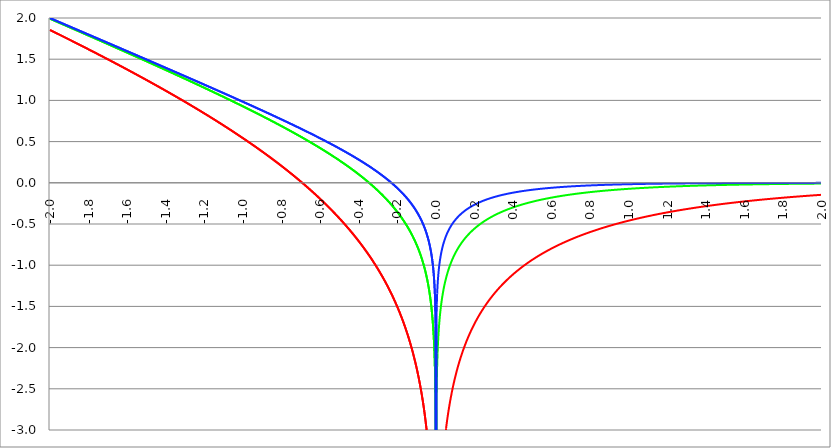
| Category | Series 1 | Series 0 | Series 2 |
|---|---|---|---|
| -2.0 | 1.855 | 1.991 | 1.999 |
| -1.998 | 1.852 | 1.989 | 1.997 |
| -1.996 | 1.85 | 1.987 | 1.995 |
| -1.994 | 1.848 | 1.985 | 1.993 |
| -1.992 | 1.845 | 1.983 | 1.991 |
| -1.99 | 1.843 | 1.981 | 1.989 |
| -1.988 | 1.841 | 1.979 | 1.987 |
| -1.986 | 1.838 | 1.976 | 1.985 |
| -1.984 | 1.836 | 1.974 | 1.983 |
| -1.982 | 1.834 | 1.972 | 1.981 |
| -1.98 | 1.831 | 1.97 | 1.979 |
| -1.978 | 1.829 | 1.968 | 1.977 |
| -1.976 | 1.827 | 1.966 | 1.975 |
| -1.974 | 1.824 | 1.964 | 1.973 |
| -1.972 | 1.822 | 1.962 | 1.971 |
| -1.97 | 1.82 | 1.96 | 1.969 |
| -1.968 | 1.817 | 1.958 | 1.967 |
| -1.966 | 1.815 | 1.956 | 1.965 |
| -1.964 | 1.813 | 1.954 | 1.963 |
| -1.962 | 1.811 | 1.952 | 1.961 |
| -1.96 | 1.808 | 1.95 | 1.959 |
| -1.958 | 1.806 | 1.948 | 1.957 |
| -1.956 | 1.804 | 1.946 | 1.955 |
| -1.954 | 1.801 | 1.944 | 1.953 |
| -1.952 | 1.799 | 1.942 | 1.951 |
| -1.95 | 1.797 | 1.94 | 1.949 |
| -1.948 | 1.794 | 1.938 | 1.947 |
| -1.946 | 1.792 | 1.936 | 1.945 |
| -1.944 | 1.79 | 1.934 | 1.943 |
| -1.942 | 1.787 | 1.932 | 1.941 |
| -1.94 | 1.785 | 1.93 | 1.939 |
| -1.938 | 1.783 | 1.928 | 1.937 |
| -1.936 | 1.78 | 1.925 | 1.935 |
| -1.934 | 1.778 | 1.923 | 1.933 |
| -1.932 | 1.776 | 1.921 | 1.931 |
| -1.93 | 1.773 | 1.919 | 1.929 |
| -1.928 | 1.771 | 1.917 | 1.927 |
| -1.926 | 1.768 | 1.915 | 1.925 |
| -1.924 | 1.766 | 1.913 | 1.923 |
| -1.922 | 1.764 | 1.911 | 1.921 |
| -1.92 | 1.761 | 1.909 | 1.919 |
| -1.918 | 1.759 | 1.907 | 1.917 |
| -1.916 | 1.757 | 1.905 | 1.915 |
| -1.914 | 1.754 | 1.903 | 1.913 |
| -1.912 | 1.752 | 1.901 | 1.911 |
| -1.91 | 1.75 | 1.899 | 1.909 |
| -1.908 | 1.747 | 1.897 | 1.907 |
| -1.906 | 1.745 | 1.895 | 1.905 |
| -1.904 | 1.743 | 1.893 | 1.903 |
| -1.902 | 1.74 | 1.891 | 1.901 |
| -1.9 | 1.738 | 1.889 | 1.899 |
| -1.898 | 1.736 | 1.887 | 1.897 |
| -1.896 | 1.733 | 1.885 | 1.895 |
| -1.894 | 1.731 | 1.883 | 1.893 |
| -1.892 | 1.729 | 1.881 | 1.891 |
| -1.89 | 1.726 | 1.878 | 1.889 |
| -1.888 | 1.724 | 1.876 | 1.887 |
| -1.886 | 1.722 | 1.874 | 1.885 |
| -1.884 | 1.719 | 1.872 | 1.883 |
| -1.882 | 1.717 | 1.87 | 1.881 |
| -1.88 | 1.714 | 1.868 | 1.879 |
| -1.878 | 1.712 | 1.866 | 1.877 |
| -1.876 | 1.71 | 1.864 | 1.875 |
| -1.874 | 1.707 | 1.862 | 1.873 |
| -1.872 | 1.705 | 1.86 | 1.871 |
| -1.87 | 1.703 | 1.858 | 1.869 |
| -1.868 | 1.7 | 1.856 | 1.867 |
| -1.866 | 1.698 | 1.854 | 1.865 |
| -1.864 | 1.696 | 1.852 | 1.863 |
| -1.862 | 1.693 | 1.85 | 1.861 |
| -1.86 | 1.691 | 1.848 | 1.859 |
| -1.858 | 1.688 | 1.846 | 1.857 |
| -1.856 | 1.686 | 1.844 | 1.855 |
| -1.854 | 1.684 | 1.842 | 1.853 |
| -1.852 | 1.681 | 1.84 | 1.851 |
| -1.85 | 1.679 | 1.837 | 1.849 |
| -1.848 | 1.677 | 1.835 | 1.847 |
| -1.846 | 1.674 | 1.833 | 1.845 |
| -1.844 | 1.672 | 1.831 | 1.843 |
| -1.842 | 1.669 | 1.829 | 1.841 |
| -1.84 | 1.667 | 1.827 | 1.839 |
| -1.838 | 1.665 | 1.825 | 1.837 |
| -1.836 | 1.662 | 1.823 | 1.835 |
| -1.834 | 1.66 | 1.821 | 1.833 |
| -1.832 | 1.658 | 1.819 | 1.831 |
| -1.83 | 1.655 | 1.817 | 1.829 |
| -1.828 | 1.653 | 1.815 | 1.827 |
| -1.826 | 1.65 | 1.813 | 1.825 |
| -1.824 | 1.648 | 1.811 | 1.823 |
| -1.822 | 1.646 | 1.809 | 1.821 |
| -1.82 | 1.643 | 1.807 | 1.819 |
| -1.818 | 1.641 | 1.805 | 1.817 |
| -1.816 | 1.638 | 1.803 | 1.815 |
| -1.814 | 1.636 | 1.801 | 1.813 |
| -1.812 | 1.634 | 1.798 | 1.811 |
| -1.81 | 1.631 | 1.796 | 1.809 |
| -1.808 | 1.629 | 1.794 | 1.807 |
| -1.806 | 1.627 | 1.792 | 1.805 |
| -1.804 | 1.624 | 1.79 | 1.803 |
| -1.802 | 1.622 | 1.788 | 1.801 |
| -1.8 | 1.619 | 1.786 | 1.798 |
| -1.798 | 1.617 | 1.784 | 1.796 |
| -1.796 | 1.615 | 1.782 | 1.794 |
| -1.794 | 1.612 | 1.78 | 1.792 |
| -1.792 | 1.61 | 1.778 | 1.79 |
| -1.79 | 1.607 | 1.776 | 1.788 |
| -1.788 | 1.605 | 1.774 | 1.786 |
| -1.786 | 1.603 | 1.772 | 1.784 |
| -1.784 | 1.6 | 1.77 | 1.782 |
| -1.782 | 1.598 | 1.768 | 1.78 |
| -1.78 | 1.595 | 1.766 | 1.778 |
| -1.778 | 1.593 | 1.764 | 1.776 |
| -1.776 | 1.59 | 1.761 | 1.774 |
| -1.774 | 1.588 | 1.759 | 1.772 |
| -1.772 | 1.586 | 1.757 | 1.77 |
| -1.77 | 1.583 | 1.755 | 1.768 |
| -1.768 | 1.581 | 1.753 | 1.766 |
| -1.766 | 1.578 | 1.751 | 1.764 |
| -1.764 | 1.576 | 1.749 | 1.762 |
| -1.762 | 1.574 | 1.747 | 1.76 |
| -1.76 | 1.571 | 1.745 | 1.758 |
| -1.758 | 1.569 | 1.743 | 1.756 |
| -1.756 | 1.566 | 1.741 | 1.754 |
| -1.754 | 1.564 | 1.739 | 1.752 |
| -1.752 | 1.562 | 1.737 | 1.75 |
| -1.75 | 1.559 | 1.735 | 1.748 |
| -1.748 | 1.557 | 1.733 | 1.746 |
| -1.746 | 1.554 | 1.731 | 1.744 |
| -1.744 | 1.552 | 1.728 | 1.742 |
| -1.742 | 1.549 | 1.726 | 1.74 |
| -1.74 | 1.547 | 1.724 | 1.738 |
| -1.738 | 1.545 | 1.722 | 1.736 |
| -1.736 | 1.542 | 1.72 | 1.734 |
| -1.734 | 1.54 | 1.718 | 1.732 |
| -1.732 | 1.537 | 1.716 | 1.73 |
| -1.73 | 1.535 | 1.714 | 1.728 |
| -1.728 | 1.532 | 1.712 | 1.726 |
| -1.726 | 1.53 | 1.71 | 1.724 |
| -1.724 | 1.528 | 1.708 | 1.722 |
| -1.722 | 1.525 | 1.706 | 1.72 |
| -1.72 | 1.523 | 1.704 | 1.718 |
| -1.718 | 1.52 | 1.702 | 1.716 |
| -1.716 | 1.518 | 1.7 | 1.714 |
| -1.714 | 1.515 | 1.698 | 1.712 |
| -1.712 | 1.513 | 1.695 | 1.71 |
| -1.71 | 1.51 | 1.693 | 1.708 |
| -1.708 | 1.508 | 1.691 | 1.706 |
| -1.706 | 1.506 | 1.689 | 1.704 |
| -1.704 | 1.503 | 1.687 | 1.702 |
| -1.702 | 1.501 | 1.685 | 1.7 |
| -1.7 | 1.498 | 1.683 | 1.698 |
| -1.698 | 1.496 | 1.681 | 1.696 |
| -1.696 | 1.493 | 1.679 | 1.694 |
| -1.694 | 1.491 | 1.677 | 1.692 |
| -1.692 | 1.488 | 1.675 | 1.69 |
| -1.69 | 1.486 | 1.673 | 1.688 |
| -1.688 | 1.484 | 1.671 | 1.686 |
| -1.686 | 1.481 | 1.669 | 1.684 |
| -1.684 | 1.479 | 1.666 | 1.682 |
| -1.682 | 1.476 | 1.664 | 1.68 |
| -1.68 | 1.474 | 1.662 | 1.678 |
| -1.678 | 1.471 | 1.66 | 1.676 |
| -1.676 | 1.469 | 1.658 | 1.674 |
| -1.674 | 1.466 | 1.656 | 1.672 |
| -1.672 | 1.464 | 1.654 | 1.67 |
| -1.67 | 1.461 | 1.652 | 1.668 |
| -1.668 | 1.459 | 1.65 | 1.666 |
| -1.666 | 1.457 | 1.648 | 1.664 |
| -1.664 | 1.454 | 1.646 | 1.662 |
| -1.662 | 1.452 | 1.644 | 1.66 |
| -1.66 | 1.449 | 1.642 | 1.658 |
| -1.658 | 1.447 | 1.64 | 1.656 |
| -1.656 | 1.444 | 1.637 | 1.654 |
| -1.654 | 1.442 | 1.635 | 1.652 |
| -1.652 | 1.439 | 1.633 | 1.65 |
| -1.65 | 1.437 | 1.631 | 1.648 |
| -1.648 | 1.434 | 1.629 | 1.646 |
| -1.646 | 1.432 | 1.627 | 1.644 |
| -1.644 | 1.429 | 1.625 | 1.642 |
| -1.642 | 1.427 | 1.623 | 1.64 |
| -1.64 | 1.424 | 1.621 | 1.638 |
| -1.638 | 1.422 | 1.619 | 1.636 |
| -1.636 | 1.419 | 1.617 | 1.634 |
| -1.634 | 1.417 | 1.615 | 1.632 |
| -1.632 | 1.414 | 1.613 | 1.629 |
| -1.63 | 1.412 | 1.61 | 1.627 |
| -1.628 | 1.409 | 1.608 | 1.625 |
| -1.626 | 1.407 | 1.606 | 1.623 |
| -1.624 | 1.404 | 1.604 | 1.621 |
| -1.622 | 1.402 | 1.602 | 1.619 |
| -1.62 | 1.399 | 1.6 | 1.617 |
| -1.618 | 1.397 | 1.598 | 1.615 |
| -1.616 | 1.394 | 1.596 | 1.613 |
| -1.614 | 1.392 | 1.594 | 1.611 |
| -1.612 | 1.389 | 1.592 | 1.609 |
| -1.61 | 1.387 | 1.59 | 1.607 |
| -1.608 | 1.384 | 1.588 | 1.605 |
| -1.606 | 1.382 | 1.585 | 1.603 |
| -1.604 | 1.379 | 1.583 | 1.601 |
| -1.602 | 1.377 | 1.581 | 1.599 |
| -1.6 | 1.374 | 1.579 | 1.597 |
| -1.598 | 1.372 | 1.577 | 1.595 |
| -1.596 | 1.369 | 1.575 | 1.593 |
| -1.594 | 1.367 | 1.573 | 1.591 |
| -1.592 | 1.364 | 1.571 | 1.589 |
| -1.59 | 1.362 | 1.569 | 1.587 |
| -1.588 | 1.359 | 1.567 | 1.585 |
| -1.586 | 1.357 | 1.565 | 1.583 |
| -1.584 | 1.354 | 1.563 | 1.581 |
| -1.582 | 1.352 | 1.56 | 1.579 |
| -1.58 | 1.349 | 1.558 | 1.577 |
| -1.578 | 1.347 | 1.556 | 1.575 |
| -1.576 | 1.344 | 1.554 | 1.573 |
| -1.574 | 1.342 | 1.552 | 1.571 |
| -1.572 | 1.339 | 1.55 | 1.569 |
| -1.57 | 1.337 | 1.548 | 1.567 |
| -1.568 | 1.334 | 1.546 | 1.565 |
| -1.566 | 1.332 | 1.544 | 1.563 |
| -1.564 | 1.329 | 1.542 | 1.561 |
| -1.562 | 1.327 | 1.54 | 1.559 |
| -1.56 | 1.324 | 1.537 | 1.557 |
| -1.558 | 1.322 | 1.535 | 1.555 |
| -1.556 | 1.319 | 1.533 | 1.553 |
| -1.554 | 1.317 | 1.531 | 1.551 |
| -1.552 | 1.314 | 1.529 | 1.549 |
| -1.55 | 1.311 | 1.527 | 1.547 |
| -1.548 | 1.309 | 1.525 | 1.545 |
| -1.546 | 1.306 | 1.523 | 1.543 |
| -1.544 | 1.304 | 1.521 | 1.541 |
| -1.542 | 1.301 | 1.519 | 1.539 |
| -1.54 | 1.299 | 1.516 | 1.537 |
| -1.538 | 1.296 | 1.514 | 1.535 |
| -1.536 | 1.294 | 1.512 | 1.533 |
| -1.534 | 1.291 | 1.51 | 1.531 |
| -1.532 | 1.289 | 1.508 | 1.529 |
| -1.53 | 1.286 | 1.506 | 1.527 |
| -1.528 | 1.283 | 1.504 | 1.525 |
| -1.526 | 1.281 | 1.502 | 1.523 |
| -1.524 | 1.278 | 1.5 | 1.521 |
| -1.522 | 1.276 | 1.498 | 1.519 |
| -1.52 | 1.273 | 1.495 | 1.516 |
| -1.518 | 1.271 | 1.493 | 1.514 |
| -1.516 | 1.268 | 1.491 | 1.512 |
| -1.514 | 1.266 | 1.489 | 1.51 |
| -1.512 | 1.263 | 1.487 | 1.508 |
| -1.51 | 1.26 | 1.485 | 1.506 |
| -1.508 | 1.258 | 1.483 | 1.504 |
| -1.506 | 1.255 | 1.481 | 1.502 |
| -1.504 | 1.253 | 1.479 | 1.5 |
| -1.502 | 1.25 | 1.477 | 1.498 |
| -1.5 | 1.248 | 1.474 | 1.496 |
| -1.498 | 1.245 | 1.472 | 1.494 |
| -1.496 | 1.242 | 1.47 | 1.492 |
| -1.494 | 1.24 | 1.468 | 1.49 |
| -1.492 | 1.237 | 1.466 | 1.488 |
| -1.49 | 1.235 | 1.464 | 1.486 |
| -1.488 | 1.232 | 1.462 | 1.484 |
| -1.486 | 1.229 | 1.46 | 1.482 |
| -1.484 | 1.227 | 1.458 | 1.48 |
| -1.482 | 1.224 | 1.456 | 1.478 |
| -1.48 | 1.222 | 1.453 | 1.476 |
| -1.478 | 1.219 | 1.451 | 1.474 |
| -1.476 | 1.217 | 1.449 | 1.472 |
| -1.474 | 1.214 | 1.447 | 1.47 |
| -1.472 | 1.211 | 1.445 | 1.468 |
| -1.469999999999999 | 1.209 | 1.443 | 1.466 |
| -1.467999999999999 | 1.206 | 1.441 | 1.464 |
| -1.465999999999999 | 1.204 | 1.439 | 1.462 |
| -1.463999999999999 | 1.201 | 1.437 | 1.46 |
| -1.461999999999999 | 1.198 | 1.434 | 1.458 |
| -1.459999999999999 | 1.196 | 1.432 | 1.456 |
| -1.457999999999999 | 1.193 | 1.43 | 1.454 |
| -1.455999999999999 | 1.191 | 1.428 | 1.452 |
| -1.453999999999999 | 1.188 | 1.426 | 1.45 |
| -1.451999999999999 | 1.185 | 1.424 | 1.448 |
| -1.449999999999999 | 1.183 | 1.422 | 1.446 |
| -1.447999999999999 | 1.18 | 1.42 | 1.444 |
| -1.445999999999999 | 1.177 | 1.417 | 1.442 |
| -1.443999999999999 | 1.175 | 1.415 | 1.44 |
| -1.441999999999999 | 1.172 | 1.413 | 1.438 |
| -1.439999999999999 | 1.17 | 1.411 | 1.436 |
| -1.437999999999999 | 1.167 | 1.409 | 1.434 |
| -1.435999999999999 | 1.164 | 1.407 | 1.431 |
| -1.433999999999999 | 1.162 | 1.405 | 1.429 |
| -1.431999999999999 | 1.159 | 1.403 | 1.427 |
| -1.429999999999999 | 1.156 | 1.401 | 1.425 |
| -1.427999999999999 | 1.154 | 1.398 | 1.423 |
| -1.425999999999999 | 1.151 | 1.396 | 1.421 |
| -1.423999999999999 | 1.149 | 1.394 | 1.419 |
| -1.421999999999999 | 1.146 | 1.392 | 1.417 |
| -1.419999999999999 | 1.143 | 1.39 | 1.415 |
| -1.417999999999999 | 1.141 | 1.388 | 1.413 |
| -1.415999999999999 | 1.138 | 1.386 | 1.411 |
| -1.413999999999999 | 1.135 | 1.384 | 1.409 |
| -1.411999999999999 | 1.133 | 1.381 | 1.407 |
| -1.409999999999999 | 1.13 | 1.379 | 1.405 |
| -1.407999999999999 | 1.127 | 1.377 | 1.403 |
| -1.405999999999999 | 1.125 | 1.375 | 1.401 |
| -1.403999999999999 | 1.122 | 1.373 | 1.399 |
| -1.401999999999999 | 1.119 | 1.371 | 1.397 |
| -1.399999999999999 | 1.117 | 1.369 | 1.395 |
| -1.397999999999999 | 1.114 | 1.367 | 1.393 |
| -1.395999999999999 | 1.112 | 1.364 | 1.391 |
| -1.393999999999999 | 1.109 | 1.362 | 1.389 |
| -1.391999999999999 | 1.106 | 1.36 | 1.387 |
| -1.389999999999999 | 1.104 | 1.358 | 1.385 |
| -1.387999999999999 | 1.101 | 1.356 | 1.383 |
| -1.385999999999999 | 1.098 | 1.354 | 1.381 |
| -1.383999999999999 | 1.096 | 1.352 | 1.379 |
| -1.381999999999999 | 1.093 | 1.349 | 1.377 |
| -1.379999999999999 | 1.09 | 1.347 | 1.375 |
| -1.377999999999999 | 1.088 | 1.345 | 1.373 |
| -1.375999999999999 | 1.085 | 1.343 | 1.371 |
| -1.373999999999999 | 1.082 | 1.341 | 1.369 |
| -1.371999999999999 | 1.08 | 1.339 | 1.367 |
| -1.369999999999999 | 1.077 | 1.337 | 1.364 |
| -1.367999999999999 | 1.074 | 1.334 | 1.362 |
| -1.365999999999999 | 1.071 | 1.332 | 1.36 |
| -1.363999999999999 | 1.069 | 1.33 | 1.358 |
| -1.361999999999999 | 1.066 | 1.328 | 1.356 |
| -1.359999999999999 | 1.063 | 1.326 | 1.354 |
| -1.357999999999999 | 1.061 | 1.324 | 1.352 |
| -1.355999999999999 | 1.058 | 1.322 | 1.35 |
| -1.353999999999999 | 1.055 | 1.32 | 1.348 |
| -1.351999999999999 | 1.053 | 1.317 | 1.346 |
| -1.349999999999999 | 1.05 | 1.315 | 1.344 |
| -1.347999999999999 | 1.047 | 1.313 | 1.342 |
| -1.345999999999999 | 1.045 | 1.311 | 1.34 |
| -1.343999999999999 | 1.042 | 1.309 | 1.338 |
| -1.341999999999999 | 1.039 | 1.307 | 1.336 |
| -1.339999999999999 | 1.036 | 1.304 | 1.334 |
| -1.337999999999999 | 1.034 | 1.302 | 1.332 |
| -1.335999999999999 | 1.031 | 1.3 | 1.33 |
| -1.333999999999999 | 1.028 | 1.298 | 1.328 |
| -1.331999999999999 | 1.026 | 1.296 | 1.326 |
| -1.329999999999999 | 1.023 | 1.294 | 1.324 |
| -1.327999999999999 | 1.02 | 1.292 | 1.322 |
| -1.325999999999999 | 1.017 | 1.289 | 1.32 |
| -1.323999999999999 | 1.015 | 1.287 | 1.318 |
| -1.321999999999999 | 1.012 | 1.285 | 1.316 |
| -1.319999999999999 | 1.009 | 1.283 | 1.314 |
| -1.317999999999999 | 1.006 | 1.281 | 1.312 |
| -1.315999999999999 | 1.004 | 1.279 | 1.31 |
| -1.313999999999999 | 1.001 | 1.277 | 1.307 |
| -1.311999999999999 | 0.998 | 1.274 | 1.305 |
| -1.309999999999999 | 0.996 | 1.272 | 1.303 |
| -1.307999999999999 | 0.993 | 1.27 | 1.301 |
| -1.305999999999999 | 0.99 | 1.268 | 1.299 |
| -1.303999999999999 | 0.987 | 1.266 | 1.297 |
| -1.301999999999999 | 0.985 | 1.264 | 1.295 |
| -1.299999999999999 | 0.982 | 1.261 | 1.293 |
| -1.297999999999999 | 0.979 | 1.259 | 1.291 |
| -1.295999999999999 | 0.976 | 1.257 | 1.289 |
| -1.293999999999999 | 0.974 | 1.255 | 1.287 |
| -1.291999999999999 | 0.971 | 1.253 | 1.285 |
| -1.289999999999999 | 0.968 | 1.251 | 1.283 |
| -1.287999999999999 | 0.965 | 1.248 | 1.281 |
| -1.285999999999999 | 0.963 | 1.246 | 1.279 |
| -1.283999999999999 | 0.96 | 1.244 | 1.277 |
| -1.281999999999999 | 0.957 | 1.242 | 1.275 |
| -1.279999999999999 | 0.954 | 1.24 | 1.273 |
| -1.277999999999999 | 0.951 | 1.238 | 1.271 |
| -1.275999999999999 | 0.949 | 1.235 | 1.269 |
| -1.273999999999999 | 0.946 | 1.233 | 1.267 |
| -1.271999999999999 | 0.943 | 1.231 | 1.265 |
| -1.269999999999999 | 0.94 | 1.229 | 1.263 |
| -1.267999999999999 | 0.938 | 1.227 | 1.26 |
| -1.265999999999999 | 0.935 | 1.225 | 1.258 |
| -1.263999999999999 | 0.932 | 1.222 | 1.256 |
| -1.261999999999999 | 0.929 | 1.22 | 1.254 |
| -1.259999999999999 | 0.926 | 1.218 | 1.252 |
| -1.257999999999999 | 0.924 | 1.216 | 1.25 |
| -1.255999999999999 | 0.921 | 1.214 | 1.248 |
| -1.253999999999999 | 0.918 | 1.212 | 1.246 |
| -1.251999999999999 | 0.915 | 1.209 | 1.244 |
| -1.249999999999999 | 0.912 | 1.207 | 1.242 |
| -1.247999999999999 | 0.91 | 1.205 | 1.24 |
| -1.245999999999999 | 0.907 | 1.203 | 1.238 |
| -1.243999999999999 | 0.904 | 1.201 | 1.236 |
| -1.241999999999999 | 0.901 | 1.198 | 1.234 |
| -1.239999999999999 | 0.898 | 1.196 | 1.232 |
| -1.237999999999999 | 0.896 | 1.194 | 1.23 |
| -1.235999999999999 | 0.893 | 1.192 | 1.228 |
| -1.233999999999999 | 0.89 | 1.19 | 1.226 |
| -1.231999999999999 | 0.887 | 1.188 | 1.224 |
| -1.229999999999999 | 0.884 | 1.185 | 1.222 |
| -1.227999999999999 | 0.881 | 1.183 | 1.22 |
| -1.225999999999999 | 0.879 | 1.181 | 1.217 |
| -1.223999999999999 | 0.876 | 1.179 | 1.215 |
| -1.221999999999999 | 0.873 | 1.177 | 1.213 |
| -1.219999999999999 | 0.87 | 1.174 | 1.211 |
| -1.217999999999999 | 0.867 | 1.172 | 1.209 |
| -1.215999999999999 | 0.864 | 1.17 | 1.207 |
| -1.213999999999999 | 0.862 | 1.168 | 1.205 |
| -1.211999999999999 | 0.859 | 1.166 | 1.203 |
| -1.209999999999999 | 0.856 | 1.163 | 1.201 |
| -1.207999999999999 | 0.853 | 1.161 | 1.199 |
| -1.205999999999999 | 0.85 | 1.159 | 1.197 |
| -1.203999999999999 | 0.847 | 1.157 | 1.195 |
| -1.201999999999999 | 0.844 | 1.155 | 1.193 |
| -1.199999999999999 | 0.842 | 1.152 | 1.191 |
| -1.197999999999999 | 0.839 | 1.15 | 1.189 |
| -1.195999999999999 | 0.836 | 1.148 | 1.187 |
| -1.193999999999999 | 0.833 | 1.146 | 1.185 |
| -1.191999999999999 | 0.83 | 1.144 | 1.183 |
| -1.189999999999999 | 0.827 | 1.141 | 1.18 |
| -1.187999999999999 | 0.824 | 1.139 | 1.178 |
| -1.185999999999999 | 0.822 | 1.137 | 1.176 |
| -1.183999999999999 | 0.819 | 1.135 | 1.174 |
| -1.181999999999999 | 0.816 | 1.133 | 1.172 |
| -1.179999999999999 | 0.813 | 1.13 | 1.17 |
| -1.177999999999999 | 0.81 | 1.128 | 1.168 |
| -1.175999999999999 | 0.807 | 1.126 | 1.166 |
| -1.173999999999999 | 0.804 | 1.124 | 1.164 |
| -1.171999999999999 | 0.801 | 1.122 | 1.162 |
| -1.169999999999999 | 0.798 | 1.119 | 1.16 |
| -1.167999999999999 | 0.796 | 1.117 | 1.158 |
| -1.165999999999999 | 0.793 | 1.115 | 1.156 |
| -1.163999999999999 | 0.79 | 1.113 | 1.154 |
| -1.161999999999999 | 0.787 | 1.11 | 1.152 |
| -1.159999999999999 | 0.784 | 1.108 | 1.15 |
| -1.157999999999999 | 0.781 | 1.106 | 1.148 |
| -1.155999999999999 | 0.778 | 1.104 | 1.145 |
| -1.153999999999999 | 0.775 | 1.102 | 1.143 |
| -1.151999999999999 | 0.772 | 1.099 | 1.141 |
| -1.149999999999999 | 0.769 | 1.097 | 1.139 |
| -1.147999999999999 | 0.766 | 1.095 | 1.137 |
| -1.145999999999999 | 0.763 | 1.093 | 1.135 |
| -1.143999999999999 | 0.76 | 1.091 | 1.133 |
| -1.141999999999999 | 0.758 | 1.088 | 1.131 |
| -1.139999999999999 | 0.755 | 1.086 | 1.129 |
| -1.137999999999999 | 0.752 | 1.084 | 1.127 |
| -1.135999999999999 | 0.749 | 1.082 | 1.125 |
| -1.133999999999999 | 0.746 | 1.079 | 1.123 |
| -1.131999999999999 | 0.743 | 1.077 | 1.121 |
| -1.129999999999999 | 0.74 | 1.075 | 1.119 |
| -1.127999999999999 | 0.737 | 1.073 | 1.117 |
| -1.125999999999999 | 0.734 | 1.07 | 1.114 |
| -1.123999999999999 | 0.731 | 1.068 | 1.112 |
| -1.121999999999999 | 0.728 | 1.066 | 1.11 |
| -1.119999999999999 | 0.725 | 1.064 | 1.108 |
| -1.117999999999999 | 0.722 | 1.061 | 1.106 |
| -1.115999999999999 | 0.719 | 1.059 | 1.104 |
| -1.113999999999999 | 0.716 | 1.057 | 1.102 |
| -1.111999999999999 | 0.713 | 1.055 | 1.1 |
| -1.109999999999999 | 0.71 | 1.053 | 1.098 |
| -1.107999999999999 | 0.707 | 1.05 | 1.096 |
| -1.105999999999999 | 0.704 | 1.048 | 1.094 |
| -1.103999999999999 | 0.701 | 1.046 | 1.092 |
| -1.101999999999999 | 0.698 | 1.044 | 1.09 |
| -1.099999999999999 | 0.695 | 1.041 | 1.087 |
| -1.097999999999999 | 0.692 | 1.039 | 1.085 |
| -1.095999999999999 | 0.689 | 1.037 | 1.083 |
| -1.093999999999999 | 0.686 | 1.035 | 1.081 |
| -1.091999999999999 | 0.683 | 1.032 | 1.079 |
| -1.089999999999999 | 0.68 | 1.03 | 1.077 |
| -1.087999999999999 | 0.677 | 1.028 | 1.075 |
| -1.085999999999999 | 0.674 | 1.026 | 1.073 |
| -1.083999999999999 | 0.671 | 1.023 | 1.071 |
| -1.081999999999999 | 0.668 | 1.021 | 1.069 |
| -1.079999999999999 | 0.665 | 1.019 | 1.067 |
| -1.077999999999999 | 0.662 | 1.016 | 1.065 |
| -1.075999999999999 | 0.659 | 1.014 | 1.063 |
| -1.073999999999999 | 0.656 | 1.012 | 1.06 |
| -1.071999999999999 | 0.653 | 1.01 | 1.058 |
| -1.069999999999999 | 0.65 | 1.007 | 1.056 |
| -1.067999999999999 | 0.647 | 1.005 | 1.054 |
| -1.065999999999999 | 0.644 | 1.003 | 1.052 |
| -1.063999999999999 | 0.641 | 1.001 | 1.05 |
| -1.061999999999999 | 0.638 | 0.998 | 1.048 |
| -1.059999999999999 | 0.635 | 0.996 | 1.046 |
| -1.057999999999999 | 0.632 | 0.994 | 1.044 |
| -1.055999999999999 | 0.629 | 0.992 | 1.042 |
| -1.053999999999999 | 0.625 | 0.989 | 1.04 |
| -1.051999999999999 | 0.622 | 0.987 | 1.037 |
| -1.049999999999999 | 0.619 | 0.985 | 1.035 |
| -1.047999999999999 | 0.616 | 0.982 | 1.033 |
| -1.045999999999999 | 0.613 | 0.98 | 1.031 |
| -1.043999999999999 | 0.61 | 0.978 | 1.029 |
| -1.041999999999999 | 0.607 | 0.976 | 1.027 |
| -1.039999999999999 | 0.604 | 0.973 | 1.025 |
| -1.037999999999999 | 0.601 | 0.971 | 1.023 |
| -1.035999999999999 | 0.598 | 0.969 | 1.021 |
| -1.033999999999999 | 0.595 | 0.966 | 1.019 |
| -1.031999999999999 | 0.591 | 0.964 | 1.017 |
| -1.029999999999999 | 0.588 | 0.962 | 1.014 |
| -1.027999999999999 | 0.585 | 0.96 | 1.012 |
| -1.025999999999999 | 0.582 | 0.957 | 1.01 |
| -1.023999999999999 | 0.579 | 0.955 | 1.008 |
| -1.021999999999999 | 0.576 | 0.953 | 1.006 |
| -1.019999999999999 | 0.573 | 0.95 | 1.004 |
| -1.017999999999999 | 0.57 | 0.948 | 1.002 |
| -1.015999999999999 | 0.567 | 0.946 | 1 |
| -1.013999999999999 | 0.563 | 0.943 | 0.998 |
| -1.011999999999999 | 0.56 | 0.941 | 0.996 |
| -1.009999999999999 | 0.557 | 0.939 | 0.993 |
| -1.007999999999999 | 0.554 | 0.937 | 0.991 |
| -1.005999999999999 | 0.551 | 0.934 | 0.989 |
| -1.003999999999999 | 0.548 | 0.932 | 0.987 |
| -1.001999999999999 | 0.544 | 0.93 | 0.985 |
| -0.999999999999999 | 0.541 | 0.927 | 0.983 |
| -0.997999999999999 | 0.538 | 0.925 | 0.981 |
| -0.995999999999999 | 0.535 | 0.923 | 0.979 |
| -0.993999999999999 | 0.532 | 0.92 | 0.977 |
| -0.991999999999999 | 0.529 | 0.918 | 0.975 |
| -0.989999999999999 | 0.525 | 0.916 | 0.972 |
| -0.987999999999999 | 0.522 | 0.913 | 0.97 |
| -0.985999999999999 | 0.519 | 0.911 | 0.968 |
| -0.983999999999999 | 0.516 | 0.909 | 0.966 |
| -0.981999999999999 | 0.513 | 0.906 | 0.964 |
| -0.979999999999999 | 0.509 | 0.904 | 0.962 |
| -0.977999999999999 | 0.506 | 0.902 | 0.96 |
| -0.975999999999999 | 0.503 | 0.899 | 0.958 |
| -0.973999999999999 | 0.5 | 0.897 | 0.956 |
| -0.971999999999999 | 0.497 | 0.895 | 0.953 |
| -0.969999999999999 | 0.493 | 0.892 | 0.951 |
| -0.967999999999999 | 0.49 | 0.89 | 0.949 |
| -0.965999999999999 | 0.487 | 0.888 | 0.947 |
| -0.963999999999999 | 0.484 | 0.885 | 0.945 |
| -0.961999999999999 | 0.481 | 0.883 | 0.943 |
| -0.959999999999999 | 0.477 | 0.881 | 0.941 |
| -0.957999999999999 | 0.474 | 0.878 | 0.939 |
| -0.955999999999999 | 0.471 | 0.876 | 0.937 |
| -0.953999999999999 | 0.468 | 0.874 | 0.934 |
| -0.951999999999999 | 0.464 | 0.871 | 0.932 |
| -0.949999999999999 | 0.461 | 0.869 | 0.93 |
| -0.947999999999999 | 0.458 | 0.867 | 0.928 |
| -0.945999999999999 | 0.455 | 0.864 | 0.926 |
| -0.943999999999999 | 0.451 | 0.862 | 0.924 |
| -0.941999999999999 | 0.448 | 0.86 | 0.922 |
| -0.939999999999999 | 0.445 | 0.857 | 0.92 |
| -0.937999999999999 | 0.441 | 0.855 | 0.917 |
| -0.935999999999999 | 0.438 | 0.852 | 0.915 |
| -0.933999999999999 | 0.435 | 0.85 | 0.913 |
| -0.931999999999999 | 0.432 | 0.848 | 0.911 |
| -0.929999999999999 | 0.428 | 0.845 | 0.909 |
| -0.927999999999999 | 0.425 | 0.843 | 0.907 |
| -0.925999999999999 | 0.422 | 0.841 | 0.905 |
| -0.923999999999999 | 0.418 | 0.838 | 0.902 |
| -0.921999999999999 | 0.415 | 0.836 | 0.9 |
| -0.919999999999999 | 0.412 | 0.834 | 0.898 |
| -0.917999999999999 | 0.408 | 0.831 | 0.896 |
| -0.915999999999999 | 0.405 | 0.829 | 0.894 |
| -0.913999999999999 | 0.402 | 0.826 | 0.892 |
| -0.911999999999999 | 0.398 | 0.824 | 0.89 |
| -0.909999999999999 | 0.395 | 0.822 | 0.888 |
| -0.907999999999999 | 0.392 | 0.819 | 0.885 |
| -0.905999999999999 | 0.388 | 0.817 | 0.883 |
| -0.903999999999999 | 0.385 | 0.814 | 0.881 |
| -0.901999999999999 | 0.382 | 0.812 | 0.879 |
| -0.899999999999999 | 0.378 | 0.81 | 0.877 |
| -0.897999999999999 | 0.375 | 0.807 | 0.875 |
| -0.895999999999999 | 0.371 | 0.805 | 0.873 |
| -0.893999999999999 | 0.368 | 0.802 | 0.87 |
| -0.891999999999999 | 0.365 | 0.8 | 0.868 |
| -0.889999999999999 | 0.361 | 0.798 | 0.866 |
| -0.887999999999999 | 0.358 | 0.795 | 0.864 |
| -0.885999999999999 | 0.354 | 0.793 | 0.862 |
| -0.883999999999999 | 0.351 | 0.79 | 0.86 |
| -0.881999999999999 | 0.348 | 0.788 | 0.857 |
| -0.879999999999999 | 0.344 | 0.786 | 0.855 |
| -0.877999999999999 | 0.341 | 0.783 | 0.853 |
| -0.875999999999999 | 0.337 | 0.781 | 0.851 |
| -0.873999999999999 | 0.334 | 0.778 | 0.849 |
| -0.871999999999999 | 0.331 | 0.776 | 0.847 |
| -0.869999999999999 | 0.327 | 0.773 | 0.845 |
| -0.867999999999999 | 0.324 | 0.771 | 0.842 |
| -0.865999999999999 | 0.32 | 0.769 | 0.84 |
| -0.863999999999999 | 0.317 | 0.766 | 0.838 |
| -0.861999999999999 | 0.313 | 0.764 | 0.836 |
| -0.859999999999999 | 0.31 | 0.761 | 0.834 |
| -0.857999999999999 | 0.306 | 0.759 | 0.832 |
| -0.855999999999999 | 0.303 | 0.756 | 0.829 |
| -0.853999999999999 | 0.299 | 0.754 | 0.827 |
| -0.851999999999999 | 0.296 | 0.752 | 0.825 |
| -0.849999999999999 | 0.292 | 0.749 | 0.823 |
| -0.847999999999999 | 0.289 | 0.747 | 0.821 |
| -0.845999999999999 | 0.285 | 0.744 | 0.819 |
| -0.843999999999999 | 0.282 | 0.742 | 0.816 |
| -0.841999999999999 | 0.278 | 0.739 | 0.814 |
| -0.839999999999999 | 0.275 | 0.737 | 0.812 |
| -0.837999999999999 | 0.271 | 0.734 | 0.81 |
| -0.835999999999999 | 0.268 | 0.732 | 0.808 |
| -0.833999999999999 | 0.264 | 0.729 | 0.806 |
| -0.831999999999999 | 0.261 | 0.727 | 0.803 |
| -0.829999999999999 | 0.257 | 0.725 | 0.801 |
| -0.827999999999999 | 0.254 | 0.722 | 0.799 |
| -0.825999999999999 | 0.25 | 0.72 | 0.797 |
| -0.823999999999999 | 0.247 | 0.717 | 0.795 |
| -0.821999999999999 | 0.243 | 0.715 | 0.792 |
| -0.819999999999999 | 0.239 | 0.712 | 0.79 |
| -0.817999999999999 | 0.236 | 0.71 | 0.788 |
| -0.815999999999999 | 0.232 | 0.707 | 0.786 |
| -0.813999999999999 | 0.229 | 0.705 | 0.784 |
| -0.811999999999999 | 0.225 | 0.702 | 0.781 |
| -0.809999999999999 | 0.221 | 0.7 | 0.779 |
| -0.807999999999999 | 0.218 | 0.697 | 0.777 |
| -0.805999999999999 | 0.214 | 0.695 | 0.775 |
| -0.803999999999999 | 0.211 | 0.692 | 0.773 |
| -0.801999999999999 | 0.207 | 0.69 | 0.77 |
| -0.799999999999999 | 0.203 | 0.687 | 0.768 |
| -0.797999999999999 | 0.2 | 0.685 | 0.766 |
| -0.795999999999999 | 0.196 | 0.682 | 0.764 |
| -0.793999999999999 | 0.192 | 0.68 | 0.762 |
| -0.791999999999999 | 0.189 | 0.677 | 0.759 |
| -0.789999999999999 | 0.185 | 0.675 | 0.757 |
| -0.787999999999999 | 0.181 | 0.672 | 0.755 |
| -0.785999999999999 | 0.178 | 0.67 | 0.753 |
| -0.783999999999999 | 0.174 | 0.667 | 0.751 |
| -0.781999999999999 | 0.17 | 0.665 | 0.748 |
| -0.779999999999999 | 0.167 | 0.662 | 0.746 |
| -0.777999999999999 | 0.163 | 0.66 | 0.744 |
| -0.775999999999999 | 0.159 | 0.657 | 0.742 |
| -0.773999999999999 | 0.156 | 0.654 | 0.74 |
| -0.771999999999999 | 0.152 | 0.652 | 0.737 |
| -0.769999999999999 | 0.148 | 0.649 | 0.735 |
| -0.767999999999999 | 0.144 | 0.647 | 0.733 |
| -0.765999999999999 | 0.141 | 0.644 | 0.731 |
| -0.763999999999999 | 0.137 | 0.642 | 0.728 |
| -0.761999999999999 | 0.133 | 0.639 | 0.726 |
| -0.759999999999999 | 0.13 | 0.637 | 0.724 |
| -0.757999999999999 | 0.126 | 0.634 | 0.722 |
| -0.755999999999999 | 0.122 | 0.631 | 0.72 |
| -0.753999999999999 | 0.118 | 0.629 | 0.717 |
| -0.751999999999999 | 0.114 | 0.626 | 0.715 |
| -0.749999999999999 | 0.111 | 0.624 | 0.713 |
| -0.747999999999999 | 0.107 | 0.621 | 0.711 |
| -0.745999999999999 | 0.103 | 0.619 | 0.708 |
| -0.743999999999999 | 0.099 | 0.616 | 0.706 |
| -0.741999999999999 | 0.095 | 0.613 | 0.704 |
| -0.739999999999999 | 0.092 | 0.611 | 0.702 |
| -0.737999999999999 | 0.088 | 0.608 | 0.699 |
| -0.735999999999999 | 0.084 | 0.606 | 0.697 |
| -0.733999999999999 | 0.08 | 0.603 | 0.695 |
| -0.731999999999999 | 0.076 | 0.6 | 0.693 |
| -0.729999999999999 | 0.072 | 0.598 | 0.69 |
| -0.727999999999999 | 0.069 | 0.595 | 0.688 |
| -0.725999999999999 | 0.065 | 0.593 | 0.686 |
| -0.723999999999999 | 0.061 | 0.59 | 0.684 |
| -0.721999999999999 | 0.057 | 0.587 | 0.681 |
| -0.719999999999999 | 0.053 | 0.585 | 0.679 |
| -0.717999999999999 | 0.049 | 0.582 | 0.677 |
| -0.715999999999999 | 0.045 | 0.58 | 0.675 |
| -0.713999999999999 | 0.041 | 0.577 | 0.672 |
| -0.711999999999999 | 0.037 | 0.574 | 0.67 |
| -0.709999999999999 | 0.033 | 0.572 | 0.668 |
| -0.707999999999999 | 0.029 | 0.569 | 0.666 |
| -0.705999999999999 | 0.026 | 0.566 | 0.663 |
| -0.703999999999999 | 0.022 | 0.564 | 0.661 |
| -0.701999999999999 | 0.018 | 0.561 | 0.659 |
| -0.699999999999999 | 0.014 | 0.558 | 0.656 |
| -0.697999999999999 | 0.01 | 0.556 | 0.654 |
| -0.695999999999999 | 0.006 | 0.553 | 0.652 |
| -0.693999999999999 | 0.002 | 0.55 | 0.65 |
| -0.691999999999999 | -0.002 | 0.548 | 0.647 |
| -0.689999999999999 | -0.006 | 0.545 | 0.645 |
| -0.687999999999999 | -0.01 | 0.542 | 0.643 |
| -0.685999999999999 | -0.014 | 0.54 | 0.64 |
| -0.683999999999999 | -0.018 | 0.537 | 0.638 |
| -0.681999999999999 | -0.022 | 0.534 | 0.636 |
| -0.679999999999999 | -0.026 | 0.532 | 0.634 |
| -0.677999999999999 | -0.031 | 0.529 | 0.631 |
| -0.675999999999999 | -0.035 | 0.526 | 0.629 |
| -0.673999999999999 | -0.039 | 0.524 | 0.627 |
| -0.671999999999999 | -0.043 | 0.521 | 0.624 |
| -0.669999999999999 | -0.047 | 0.518 | 0.622 |
| -0.667999999999999 | -0.051 | 0.515 | 0.62 |
| -0.665999999999999 | -0.055 | 0.513 | 0.617 |
| -0.663999999999999 | -0.059 | 0.51 | 0.615 |
| -0.661999999999999 | -0.063 | 0.507 | 0.613 |
| -0.659999999999999 | -0.067 | 0.505 | 0.61 |
| -0.657999999999999 | -0.072 | 0.502 | 0.608 |
| -0.655999999999999 | -0.076 | 0.499 | 0.606 |
| -0.653999999999999 | -0.08 | 0.496 | 0.604 |
| -0.651999999999999 | -0.084 | 0.494 | 0.601 |
| -0.649999999999999 | -0.088 | 0.491 | 0.599 |
| -0.647999999999999 | -0.092 | 0.488 | 0.597 |
| -0.645999999999999 | -0.097 | 0.485 | 0.594 |
| -0.643999999999999 | -0.101 | 0.483 | 0.592 |
| -0.641999999999999 | -0.105 | 0.48 | 0.589 |
| -0.639999999999999 | -0.109 | 0.477 | 0.587 |
| -0.637999999999999 | -0.114 | 0.474 | 0.585 |
| -0.635999999999999 | -0.118 | 0.472 | 0.582 |
| -0.633999999999999 | -0.122 | 0.469 | 0.58 |
| -0.631999999999999 | -0.126 | 0.466 | 0.578 |
| -0.629999999999999 | -0.131 | 0.463 | 0.575 |
| -0.627999999999999 | -0.135 | 0.46 | 0.573 |
| -0.625999999999999 | -0.139 | 0.458 | 0.571 |
| -0.623999999999999 | -0.143 | 0.455 | 0.568 |
| -0.621999999999999 | -0.148 | 0.452 | 0.566 |
| -0.619999999999999 | -0.152 | 0.449 | 0.564 |
| -0.617999999999999 | -0.156 | 0.446 | 0.561 |
| -0.615999999999999 | -0.161 | 0.444 | 0.559 |
| -0.613999999999999 | -0.165 | 0.441 | 0.556 |
| -0.611999999999999 | -0.169 | 0.438 | 0.554 |
| -0.609999999999999 | -0.174 | 0.435 | 0.552 |
| -0.607999999999999 | -0.178 | 0.432 | 0.549 |
| -0.605999999999999 | -0.183 | 0.429 | 0.547 |
| -0.603999999999999 | -0.187 | 0.427 | 0.545 |
| -0.601999999999999 | -0.191 | 0.424 | 0.542 |
| -0.599999999999999 | -0.196 | 0.421 | 0.54 |
| -0.597999999999999 | -0.2 | 0.418 | 0.537 |
| -0.595999999999999 | -0.205 | 0.415 | 0.535 |
| -0.593999999999999 | -0.209 | 0.412 | 0.533 |
| -0.591999999999999 | -0.214 | 0.409 | 0.53 |
| -0.589999999999999 | -0.218 | 0.406 | 0.528 |
| -0.587999999999999 | -0.223 | 0.404 | 0.525 |
| -0.585999999999999 | -0.227 | 0.401 | 0.523 |
| -0.583999999999999 | -0.232 | 0.398 | 0.521 |
| -0.581999999999999 | -0.236 | 0.395 | 0.518 |
| -0.579999999999999 | -0.241 | 0.392 | 0.516 |
| -0.577999999999999 | -0.245 | 0.389 | 0.513 |
| -0.575999999999999 | -0.25 | 0.386 | 0.511 |
| -0.573999999999999 | -0.254 | 0.383 | 0.508 |
| -0.571999999999999 | -0.259 | 0.38 | 0.506 |
| -0.569999999999999 | -0.264 | 0.377 | 0.503 |
| -0.567999999999999 | -0.268 | 0.374 | 0.501 |
| -0.565999999999999 | -0.273 | 0.371 | 0.499 |
| -0.563999999999999 | -0.277 | 0.368 | 0.496 |
| -0.561999999999999 | -0.282 | 0.365 | 0.494 |
| -0.559999999999999 | -0.287 | 0.363 | 0.491 |
| -0.557999999999999 | -0.291 | 0.36 | 0.489 |
| -0.555999999999999 | -0.296 | 0.357 | 0.486 |
| -0.553999999999999 | -0.301 | 0.354 | 0.484 |
| -0.551999999999999 | -0.306 | 0.351 | 0.481 |
| -0.549999999999999 | -0.31 | 0.348 | 0.479 |
| -0.547999999999999 | -0.315 | 0.345 | 0.476 |
| -0.545999999999999 | -0.32 | 0.342 | 0.474 |
| -0.543999999999999 | -0.325 | 0.339 | 0.471 |
| -0.541999999999999 | -0.329 | 0.336 | 0.469 |
| -0.539999999999999 | -0.334 | 0.333 | 0.466 |
| -0.537999999999999 | -0.339 | 0.33 | 0.464 |
| -0.535999999999999 | -0.344 | 0.326 | 0.461 |
| -0.533999999999999 | -0.349 | 0.323 | 0.459 |
| -0.531999999999999 | -0.353 | 0.32 | 0.456 |
| -0.529999999999999 | -0.358 | 0.317 | 0.454 |
| -0.527999999999999 | -0.363 | 0.314 | 0.451 |
| -0.525999999999999 | -0.368 | 0.311 | 0.449 |
| -0.523999999999999 | -0.373 | 0.308 | 0.446 |
| -0.521999999999999 | -0.378 | 0.305 | 0.444 |
| -0.519999999999999 | -0.383 | 0.302 | 0.441 |
| -0.517999999999999 | -0.388 | 0.299 | 0.439 |
| -0.515999999999999 | -0.393 | 0.296 | 0.436 |
| -0.513999999999999 | -0.398 | 0.293 | 0.434 |
| -0.511999999999999 | -0.403 | 0.29 | 0.431 |
| -0.509999999999999 | -0.408 | 0.286 | 0.429 |
| -0.507999999999999 | -0.413 | 0.283 | 0.426 |
| -0.505999999999999 | -0.418 | 0.28 | 0.424 |
| -0.503999999999999 | -0.423 | 0.277 | 0.421 |
| -0.501999999999999 | -0.428 | 0.274 | 0.418 |
| -0.499999999999999 | -0.433 | 0.271 | 0.416 |
| -0.497999999999999 | -0.438 | 0.267 | 0.413 |
| -0.495999999999999 | -0.443 | 0.264 | 0.411 |
| -0.493999999999999 | -0.448 | 0.261 | 0.408 |
| -0.491999999999999 | -0.453 | 0.258 | 0.406 |
| -0.489999999999999 | -0.458 | 0.255 | 0.403 |
| -0.487999999999999 | -0.464 | 0.252 | 0.4 |
| -0.485999999999999 | -0.469 | 0.248 | 0.398 |
| -0.483999999999999 | -0.474 | 0.245 | 0.395 |
| -0.481999999999999 | -0.479 | 0.242 | 0.392 |
| -0.479999999999999 | -0.484 | 0.239 | 0.39 |
| -0.477999999999999 | -0.49 | 0.235 | 0.387 |
| -0.475999999999999 | -0.495 | 0.232 | 0.385 |
| -0.473999999999999 | -0.5 | 0.229 | 0.382 |
| -0.471999999999999 | -0.506 | 0.226 | 0.379 |
| -0.469999999999999 | -0.511 | 0.222 | 0.377 |
| -0.467999999999999 | -0.516 | 0.219 | 0.374 |
| -0.465999999999999 | -0.522 | 0.216 | 0.371 |
| -0.463999999999999 | -0.527 | 0.212 | 0.369 |
| -0.461999999999999 | -0.532 | 0.209 | 0.366 |
| -0.459999999999999 | -0.538 | 0.206 | 0.363 |
| -0.457999999999999 | -0.543 | 0.202 | 0.361 |
| -0.455999999999999 | -0.549 | 0.199 | 0.358 |
| -0.453999999999999 | -0.554 | 0.196 | 0.355 |
| -0.451999999999999 | -0.56 | 0.192 | 0.353 |
| -0.449999999999999 | -0.565 | 0.189 | 0.35 |
| -0.447999999999999 | -0.571 | 0.186 | 0.347 |
| -0.445999999999999 | -0.576 | 0.182 | 0.345 |
| -0.443999999999999 | -0.582 | 0.179 | 0.342 |
| -0.441999999999999 | -0.587 | 0.176 | 0.339 |
| -0.439999999999999 | -0.593 | 0.172 | 0.336 |
| -0.437999999999999 | -0.599 | 0.169 | 0.334 |
| -0.435999999999999 | -0.604 | 0.165 | 0.331 |
| -0.433999999999999 | -0.61 | 0.162 | 0.328 |
| -0.431999999999999 | -0.616 | 0.158 | 0.325 |
| -0.429999999999999 | -0.621 | 0.155 | 0.323 |
| -0.427999999999999 | -0.627 | 0.151 | 0.32 |
| -0.425999999999999 | -0.633 | 0.148 | 0.317 |
| -0.423999999999999 | -0.639 | 0.144 | 0.314 |
| -0.421999999999999 | -0.644 | 0.141 | 0.312 |
| -0.419999999999999 | -0.65 | 0.137 | 0.309 |
| -0.417999999999999 | -0.656 | 0.134 | 0.306 |
| -0.415999999999999 | -0.662 | 0.13 | 0.303 |
| -0.413999999999999 | -0.668 | 0.127 | 0.3 |
| -0.411999999999999 | -0.674 | 0.123 | 0.298 |
| -0.409999999999999 | -0.68 | 0.12 | 0.295 |
| -0.407999999999999 | -0.686 | 0.116 | 0.292 |
| -0.405999999999999 | -0.692 | 0.113 | 0.289 |
| -0.403999999999999 | -0.698 | 0.109 | 0.286 |
| -0.401999999999999 | -0.704 | 0.105 | 0.283 |
| -0.399999999999999 | -0.71 | 0.102 | 0.281 |
| -0.397999999999999 | -0.716 | 0.098 | 0.278 |
| -0.395999999999999 | -0.722 | 0.094 | 0.275 |
| -0.393999999999999 | -0.728 | 0.091 | 0.272 |
| -0.391999999999999 | -0.734 | 0.087 | 0.269 |
| -0.389999999999999 | -0.74 | 0.083 | 0.266 |
| -0.387999999999999 | -0.746 | 0.08 | 0.263 |
| -0.385999999999999 | -0.753 | 0.076 | 0.26 |
| -0.383999999999999 | -0.759 | 0.072 | 0.257 |
| -0.381999999999999 | -0.765 | 0.069 | 0.254 |
| -0.379999999999999 | -0.772 | 0.065 | 0.252 |
| -0.377999999999999 | -0.778 | 0.061 | 0.249 |
| -0.375999999999999 | -0.784 | 0.057 | 0.246 |
| -0.373999999999999 | -0.791 | 0.053 | 0.243 |
| -0.371999999999999 | -0.797 | 0.05 | 0.24 |
| -0.369999999999998 | -0.804 | 0.046 | 0.237 |
| -0.367999999999998 | -0.81 | 0.042 | 0.234 |
| -0.365999999999998 | -0.817 | 0.038 | 0.231 |
| -0.363999999999998 | -0.823 | 0.034 | 0.228 |
| -0.361999999999998 | -0.83 | 0.03 | 0.225 |
| -0.359999999999998 | -0.836 | 0.027 | 0.222 |
| -0.357999999999998 | -0.843 | 0.023 | 0.219 |
| -0.355999999999998 | -0.85 | 0.019 | 0.216 |
| -0.353999999999998 | -0.856 | 0.015 | 0.213 |
| -0.351999999999998 | -0.863 | 0.011 | 0.21 |
| -0.349999999999998 | -0.87 | 0.007 | 0.206 |
| -0.347999999999998 | -0.877 | 0.003 | 0.203 |
| -0.345999999999998 | -0.883 | -0.001 | 0.2 |
| -0.343999999999998 | -0.89 | -0.005 | 0.197 |
| -0.341999999999998 | -0.897 | -0.009 | 0.194 |
| -0.339999999999998 | -0.904 | -0.013 | 0.191 |
| -0.337999999999998 | -0.911 | -0.017 | 0.188 |
| -0.335999999999998 | -0.918 | -0.021 | 0.185 |
| -0.333999999999998 | -0.925 | -0.025 | 0.181 |
| -0.331999999999998 | -0.932 | -0.03 | 0.178 |
| -0.329999999999998 | -0.939 | -0.034 | 0.175 |
| -0.327999999999998 | -0.946 | -0.038 | 0.172 |
| -0.325999999999998 | -0.953 | -0.042 | 0.169 |
| -0.323999999999998 | -0.961 | -0.046 | 0.166 |
| -0.321999999999998 | -0.968 | -0.05 | 0.162 |
| -0.319999999999998 | -0.975 | -0.055 | 0.159 |
| -0.317999999999998 | -0.982 | -0.059 | 0.156 |
| -0.315999999999998 | -0.99 | -0.063 | 0.153 |
| -0.313999999999998 | -0.997 | -0.067 | 0.149 |
| -0.311999999999998 | -1.005 | -0.072 | 0.146 |
| -0.309999999999998 | -1.012 | -0.076 | 0.143 |
| -0.307999999999998 | -1.02 | -0.08 | 0.139 |
| -0.305999999999998 | -1.027 | -0.085 | 0.136 |
| -0.303999999999998 | -1.035 | -0.089 | 0.133 |
| -0.301999999999998 | -1.043 | -0.094 | 0.129 |
| -0.299999999999998 | -1.05 | -0.098 | 0.126 |
| -0.297999999999998 | -1.058 | -0.102 | 0.123 |
| -0.295999999999998 | -1.066 | -0.107 | 0.119 |
| -0.293999999999998 | -1.074 | -0.111 | 0.116 |
| -0.291999999999998 | -1.081 | -0.116 | 0.112 |
| -0.289999999999998 | -1.089 | -0.12 | 0.109 |
| -0.287999999999998 | -1.097 | -0.125 | 0.106 |
| -0.285999999999998 | -1.105 | -0.13 | 0.102 |
| -0.283999999999998 | -1.113 | -0.134 | 0.099 |
| -0.281999999999998 | -1.122 | -0.139 | 0.095 |
| -0.279999999999998 | -1.13 | -0.143 | 0.092 |
| -0.277999999999998 | -1.138 | -0.148 | 0.088 |
| -0.275999999999998 | -1.146 | -0.153 | 0.085 |
| -0.273999999999998 | -1.155 | -0.157 | 0.081 |
| -0.271999999999998 | -1.163 | -0.162 | 0.077 |
| -0.269999999999998 | -1.171 | -0.167 | 0.074 |
| -0.267999999999998 | -1.18 | -0.172 | 0.07 |
| -0.265999999999998 | -1.188 | -0.177 | 0.067 |
| -0.263999999999998 | -1.197 | -0.182 | 0.063 |
| -0.261999999999998 | -1.206 | -0.186 | 0.059 |
| -0.259999999999998 | -1.214 | -0.191 | 0.056 |
| -0.257999999999998 | -1.223 | -0.196 | 0.052 |
| -0.255999999999998 | -1.232 | -0.201 | 0.048 |
| -0.253999999999998 | -1.241 | -0.206 | 0.044 |
| -0.251999999999998 | -1.25 | -0.211 | 0.041 |
| -0.249999999999998 | -1.259 | -0.216 | 0.037 |
| -0.247999999999998 | -1.268 | -0.221 | 0.033 |
| -0.245999999999998 | -1.277 | -0.227 | 0.029 |
| -0.243999999999998 | -1.286 | -0.232 | 0.025 |
| -0.241999999999998 | -1.295 | -0.237 | 0.022 |
| -0.239999999999998 | -1.305 | -0.242 | 0.018 |
| -0.237999999999998 | -1.314 | -0.247 | 0.014 |
| -0.235999999999998 | -1.324 | -0.253 | 0.01 |
| -0.233999999999998 | -1.333 | -0.258 | 0.006 |
| -0.231999999999998 | -1.343 | -0.263 | 0.002 |
| -0.229999999999998 | -1.352 | -0.269 | -0.002 |
| -0.227999999999998 | -1.362 | -0.274 | -0.006 |
| -0.225999999999998 | -1.372 | -0.28 | -0.01 |
| -0.223999999999998 | -1.382 | -0.285 | -0.014 |
| -0.221999999999998 | -1.392 | -0.291 | -0.018 |
| -0.219999999999998 | -1.402 | -0.296 | -0.022 |
| -0.217999999999998 | -1.412 | -0.302 | -0.027 |
| -0.215999999999998 | -1.423 | -0.308 | -0.031 |
| -0.213999999999998 | -1.433 | -0.314 | -0.035 |
| -0.211999999999998 | -1.443 | -0.319 | -0.039 |
| -0.209999999999998 | -1.454 | -0.325 | -0.044 |
| -0.207999999999998 | -1.464 | -0.331 | -0.048 |
| -0.205999999999998 | -1.475 | -0.337 | -0.052 |
| -0.203999999999998 | -1.486 | -0.343 | -0.056 |
| -0.201999999999998 | -1.497 | -0.349 | -0.061 |
| -0.199999999999998 | -1.508 | -0.355 | -0.065 |
| -0.197999999999998 | -1.519 | -0.361 | -0.07 |
| -0.195999999999998 | -1.53 | -0.367 | -0.074 |
| -0.193999999999998 | -1.541 | -0.373 | -0.079 |
| -0.191999999999998 | -1.553 | -0.379 | -0.083 |
| -0.189999999999998 | -1.564 | -0.386 | -0.088 |
| -0.187999999999998 | -1.576 | -0.392 | -0.092 |
| -0.185999999999998 | -1.588 | -0.399 | -0.097 |
| -0.183999999999998 | -1.599 | -0.405 | -0.102 |
| -0.181999999999998 | -1.611 | -0.412 | -0.107 |
| -0.179999999999998 | -1.623 | -0.418 | -0.111 |
| -0.177999999999998 | -1.636 | -0.425 | -0.116 |
| -0.175999999999998 | -1.648 | -0.431 | -0.121 |
| -0.173999999999998 | -1.66 | -0.438 | -0.126 |
| -0.171999999999998 | -1.673 | -0.445 | -0.131 |
| -0.169999999999998 | -1.686 | -0.452 | -0.136 |
| -0.167999999999998 | -1.699 | -0.459 | -0.141 |
| -0.165999999999998 | -1.712 | -0.466 | -0.146 |
| -0.163999999999998 | -1.725 | -0.473 | -0.151 |
| -0.161999999999998 | -1.738 | -0.48 | -0.156 |
| -0.159999999999998 | -1.752 | -0.488 | -0.161 |
| -0.157999999999998 | -1.765 | -0.495 | -0.167 |
| -0.155999999999998 | -1.779 | -0.502 | -0.172 |
| -0.153999999999998 | -1.793 | -0.51 | -0.177 |
| -0.151999999999998 | -1.807 | -0.517 | -0.183 |
| -0.149999999999998 | -1.821 | -0.525 | -0.188 |
| -0.147999999999998 | -1.836 | -0.533 | -0.194 |
| -0.145999999999998 | -1.85 | -0.541 | -0.2 |
| -0.143999999999998 | -1.865 | -0.549 | -0.205 |
| -0.141999999999998 | -1.88 | -0.557 | -0.211 |
| -0.139999999999998 | -1.895 | -0.565 | -0.217 |
| -0.137999999999998 | -1.911 | -0.573 | -0.223 |
| -0.135999999999998 | -1.926 | -0.581 | -0.229 |
| -0.133999999999998 | -1.942 | -0.59 | -0.235 |
| -0.131999999999998 | -1.958 | -0.598 | -0.241 |
| -0.129999999999998 | -1.975 | -0.607 | -0.247 |
| -0.127999999999998 | -1.991 | -0.616 | -0.253 |
| -0.125999999999998 | -2.008 | -0.625 | -0.259 |
| -0.123999999999998 | -2.025 | -0.634 | -0.266 |
| -0.121999999999998 | -2.042 | -0.643 | -0.272 |
| -0.119999999999998 | -2.06 | -0.652 | -0.279 |
| -0.117999999999998 | -2.077 | -0.662 | -0.285 |
| -0.115999999999998 | -2.096 | -0.671 | -0.292 |
| -0.113999999999998 | -2.114 | -0.681 | -0.299 |
| -0.111999999999998 | -2.133 | -0.691 | -0.306 |
| -0.109999999999998 | -2.152 | -0.701 | -0.313 |
| -0.107999999999998 | -2.171 | -0.711 | -0.32 |
| -0.105999999999998 | -2.191 | -0.722 | -0.327 |
| -0.103999999999998 | -2.211 | -0.732 | -0.335 |
| -0.101999999999998 | -2.231 | -0.743 | -0.342 |
| -0.0999999999999983 | -2.252 | -0.754 | -0.35 |
| -0.0979999999999983 | -2.273 | -0.765 | -0.358 |
| -0.0959999999999983 | -2.295 | -0.776 | -0.366 |
| -0.0939999999999983 | -2.317 | -0.788 | -0.374 |
| -0.0919999999999983 | -2.34 | -0.8 | -0.382 |
| -0.0899999999999983 | -2.363 | -0.812 | -0.39 |
| -0.0879999999999983 | -2.386 | -0.824 | -0.399 |
| -0.0859999999999983 | -2.41 | -0.837 | -0.408 |
| -0.0839999999999983 | -2.435 | -0.849 | -0.417 |
| -0.0819999999999983 | -2.46 | -0.862 | -0.426 |
| -0.0799999999999983 | -2.485 | -0.876 | -0.435 |
| -0.0779999999999983 | -2.512 | -0.889 | -0.444 |
| -0.0759999999999983 | -2.539 | -0.903 | -0.454 |
| -0.0739999999999983 | -2.566 | -0.918 | -0.464 |
| -0.0719999999999983 | -2.595 | -0.933 | -0.474 |
| -0.0699999999999983 | -2.624 | -0.948 | -0.485 |
| -0.0679999999999983 | -2.654 | -0.963 | -0.495 |
| -0.0659999999999983 | -2.685 | -0.979 | -0.506 |
| -0.0639999999999983 | -2.717 | -0.996 | -0.518 |
| -0.0619999999999983 | -2.749 | -1.012 | -0.529 |
| -0.0599999999999983 | -2.783 | -1.03 | -0.541 |
| -0.0579999999999983 | -2.818 | -1.048 | -0.553 |
| -0.0559999999999983 | -2.854 | -1.066 | -0.566 |
| -0.0539999999999983 | -2.892 | -1.086 | -0.579 |
| -0.0519999999999983 | -2.93 | -1.105 | -0.593 |
| -0.0499999999999983 | -2.971 | -1.126 | -0.607 |
| -0.0479999999999983 | -3.012 | -1.148 | -0.622 |
| -0.0459999999999983 | -3.056 | -1.17 | -0.637 |
| -0.0439999999999983 | -3.101 | -1.193 | -0.653 |
| -0.0419999999999983 | -3.149 | -1.217 | -0.669 |
| -0.0399999999999983 | -3.199 | -1.243 | -0.687 |
| -0.0379999999999982 | -3.251 | -1.269 | -0.705 |
| -0.0359999999999982 | -3.306 | -1.297 | -0.724 |
| -0.0339999999999982 | -3.364 | -1.327 | -0.744 |
| -0.0319999999999982 | -3.426 | -1.358 | -0.765 |
| -0.0299999999999982 | -3.492 | -1.392 | -0.788 |
| -0.0279999999999982 | -3.562 | -1.427 | -0.812 |
| -0.0259999999999982 | -3.637 | -1.465 | -0.837 |
| -0.0239999999999982 | -3.718 | -1.506 | -0.865 |
| -0.0219999999999982 | -3.806 | -1.551 | -0.895 |
| -0.0199999999999982 | -3.902 | -1.599 | -0.928 |
| -0.0179999999999982 | -4.008 | -1.653 | -0.964 |
| -0.0159999999999982 | -4.127 | -1.713 | -1.004 |
| -0.0139999999999982 | -4.262 | -1.781 | -1.05 |
| -0.0119999999999982 | -4.417 | -1.859 | -1.102 |
| -0.00999999999999823 | -4.6 | -1.951 | -1.164 |
| -0.00799999999999824 | -4.824 | -2.064 | -1.239 |
| -0.00599999999999824 | -5.113 | -2.208 | -1.336 |
| -0.00399999999999824 | -5.519 | -2.412 | -1.472 |
| -0.00199999999999824 | -6.214 | -2.76 | -1.704 |
| 1.76247905159244e-15 | -33.964 | -16.636 | -10.955 |
| 0.00200000000000176 | -6.216 | -2.762 | -1.706 |
| 0.00400000000000176 | -5.523 | -2.416 | -1.476 |
| 0.00600000000000176 | -5.119 | -2.214 | -1.342 |
| 0.00800000000000176 | -4.832 | -2.072 | -1.247 |
| 0.0100000000000018 | -4.61 | -1.961 | -1.174 |
| 0.0120000000000018 | -4.429 | -1.871 | -1.114 |
| 0.0140000000000018 | -4.276 | -1.795 | -1.064 |
| 0.0160000000000018 | -4.143 | -1.729 | -1.02 |
| 0.0180000000000018 | -4.026 | -1.671 | -0.982 |
| 0.0200000000000018 | -3.922 | -1.619 | -0.948 |
| 0.0220000000000018 | -3.828 | -1.573 | -0.917 |
| 0.0240000000000018 | -3.742 | -1.53 | -0.889 |
| 0.0260000000000018 | -3.663 | -1.491 | -0.863 |
| 0.0280000000000018 | -3.59 | -1.455 | -0.84 |
| 0.0300000000000018 | -3.522 | -1.422 | -0.818 |
| 0.0320000000000018 | -3.458 | -1.39 | -0.797 |
| 0.0340000000000018 | -3.398 | -1.361 | -0.778 |
| 0.0360000000000018 | -3.342 | -1.333 | -0.76 |
| 0.0380000000000018 | -3.289 | -1.307 | -0.743 |
| 0.0400000000000018 | -3.239 | -1.283 | -0.727 |
| 0.0420000000000018 | -3.191 | -1.259 | -0.711 |
| 0.0440000000000018 | -3.145 | -1.237 | -0.697 |
| 0.0460000000000018 | -3.102 | -1.216 | -0.683 |
| 0.0480000000000018 | -3.06 | -1.196 | -0.67 |
| 0.0500000000000018 | -3.021 | -1.176 | -0.657 |
| 0.0520000000000018 | -2.982 | -1.157 | -0.645 |
| 0.0540000000000018 | -2.946 | -1.14 | -0.633 |
| 0.0560000000000018 | -2.91 | -1.122 | -0.622 |
| 0.0580000000000018 | -2.876 | -1.106 | -0.611 |
| 0.0600000000000018 | -2.843 | -1.09 | -0.601 |
| 0.0620000000000018 | -2.811 | -1.074 | -0.591 |
| 0.0640000000000018 | -2.781 | -1.06 | -0.582 |
| 0.0660000000000018 | -2.751 | -1.045 | -0.572 |
| 0.0680000000000018 | -2.722 | -1.031 | -0.563 |
| 0.0700000000000018 | -2.694 | -1.018 | -0.555 |
| 0.0720000000000018 | -2.667 | -1.005 | -0.546 |
| 0.0740000000000018 | -2.64 | -0.992 | -0.538 |
| 0.0760000000000018 | -2.615 | -0.979 | -0.53 |
| 0.0780000000000018 | -2.59 | -0.967 | -0.522 |
| 0.0800000000000018 | -2.565 | -0.956 | -0.515 |
| 0.0820000000000018 | -2.542 | -0.944 | -0.508 |
| 0.0840000000000018 | -2.519 | -0.933 | -0.501 |
| 0.0860000000000018 | -2.496 | -0.923 | -0.494 |
| 0.0880000000000018 | -2.474 | -0.912 | -0.487 |
| 0.0900000000000018 | -2.453 | -0.902 | -0.48 |
| 0.0920000000000018 | -2.432 | -0.892 | -0.474 |
| 0.0940000000000018 | -2.411 | -0.882 | -0.468 |
| 0.0960000000000018 | -2.391 | -0.872 | -0.462 |
| 0.0980000000000018 | -2.371 | -0.863 | -0.456 |
| 0.100000000000002 | -2.352 | -0.854 | -0.45 |
| 0.102000000000002 | -2.333 | -0.845 | -0.444 |
| 0.104000000000002 | -2.315 | -0.836 | -0.439 |
| 0.106000000000002 | -2.297 | -0.828 | -0.433 |
| 0.108000000000002 | -2.279 | -0.819 | -0.428 |
| 0.110000000000002 | -2.262 | -0.811 | -0.423 |
| 0.112000000000002 | -2.245 | -0.803 | -0.418 |
| 0.114000000000002 | -2.228 | -0.795 | -0.413 |
| 0.116000000000002 | -2.212 | -0.787 | -0.408 |
| 0.118000000000002 | -2.195 | -0.78 | -0.403 |
| 0.120000000000002 | -2.18 | -0.772 | -0.399 |
| 0.122000000000002 | -2.164 | -0.765 | -0.394 |
| 0.124000000000002 | -2.149 | -0.758 | -0.39 |
| 0.126000000000002 | -2.134 | -0.751 | -0.385 |
| 0.128000000000002 | -2.119 | -0.744 | -0.381 |
| 0.130000000000002 | -2.105 | -0.737 | -0.377 |
| 0.132000000000002 | -2.09 | -0.73 | -0.373 |
| 0.134000000000002 | -2.076 | -0.724 | -0.369 |
| 0.136000000000002 | -2.062 | -0.717 | -0.365 |
| 0.138000000000002 | -2.049 | -0.711 | -0.361 |
| 0.140000000000002 | -2.035 | -0.705 | -0.357 |
| 0.142000000000002 | -2.022 | -0.699 | -0.353 |
| 0.144000000000002 | -2.009 | -0.693 | -0.349 |
| 0.146000000000002 | -1.996 | -0.687 | -0.346 |
| 0.148000000000002 | -1.984 | -0.681 | -0.342 |
| 0.150000000000002 | -1.971 | -0.675 | -0.338 |
| 0.152000000000002 | -1.959 | -0.669 | -0.335 |
| 0.154000000000002 | -1.947 | -0.664 | -0.331 |
| 0.156000000000002 | -1.935 | -0.658 | -0.328 |
| 0.158000000000002 | -1.923 | -0.653 | -0.325 |
| 0.160000000000002 | -1.912 | -0.648 | -0.321 |
| 0.162000000000002 | -1.9 | -0.642 | -0.318 |
| 0.164000000000002 | -1.889 | -0.637 | -0.315 |
| 0.166000000000002 | -1.878 | -0.632 | -0.312 |
| 0.168000000000002 | -1.867 | -0.627 | -0.309 |
| 0.170000000000002 | -1.856 | -0.622 | -0.306 |
| 0.172000000000002 | -1.845 | -0.617 | -0.303 |
| 0.174000000000002 | -1.834 | -0.612 | -0.3 |
| 0.176000000000002 | -1.824 | -0.607 | -0.297 |
| 0.178000000000002 | -1.814 | -0.603 | -0.294 |
| 0.180000000000002 | -1.803 | -0.598 | -0.291 |
| 0.182000000000002 | -1.793 | -0.594 | -0.289 |
| 0.184000000000002 | -1.783 | -0.589 | -0.286 |
| 0.186000000000002 | -1.774 | -0.585 | -0.283 |
| 0.188000000000002 | -1.764 | -0.58 | -0.28 |
| 0.190000000000002 | -1.754 | -0.576 | -0.278 |
| 0.192000000000002 | -1.745 | -0.571 | -0.275 |
| 0.194000000000002 | -1.735 | -0.567 | -0.273 |
| 0.196000000000002 | -1.726 | -0.563 | -0.27 |
| 0.198000000000002 | -1.717 | -0.559 | -0.268 |
| 0.200000000000002 | -1.708 | -0.555 | -0.265 |
| 0.202000000000002 | -1.699 | -0.551 | -0.263 |
| 0.204000000000002 | -1.69 | -0.547 | -0.26 |
| 0.206000000000002 | -1.681 | -0.543 | -0.258 |
| 0.208000000000002 | -1.672 | -0.539 | -0.256 |
| 0.210000000000002 | -1.664 | -0.535 | -0.254 |
| 0.212000000000002 | -1.655 | -0.531 | -0.251 |
| 0.214000000000002 | -1.647 | -0.528 | -0.249 |
| 0.216000000000002 | -1.639 | -0.524 | -0.247 |
| 0.218000000000002 | -1.63 | -0.52 | -0.245 |
| 0.220000000000002 | -1.622 | -0.516 | -0.242 |
| 0.222000000000002 | -1.614 | -0.513 | -0.24 |
| 0.224000000000002 | -1.606 | -0.509 | -0.238 |
| 0.226000000000002 | -1.598 | -0.506 | -0.236 |
| 0.228000000000002 | -1.59 | -0.502 | -0.234 |
| 0.230000000000002 | -1.582 | -0.499 | -0.232 |
| 0.232000000000002 | -1.575 | -0.495 | -0.23 |
| 0.234000000000002 | -1.567 | -0.492 | -0.228 |
| 0.236000000000002 | -1.56 | -0.489 | -0.226 |
| 0.238000000000002 | -1.552 | -0.485 | -0.224 |
| 0.240000000000002 | -1.545 | -0.482 | -0.222 |
| 0.242000000000002 | -1.537 | -0.479 | -0.22 |
| 0.244000000000002 | -1.53 | -0.476 | -0.219 |
| 0.246000000000002 | -1.523 | -0.473 | -0.217 |
| 0.248000000000002 | -1.516 | -0.469 | -0.215 |
| 0.250000000000002 | -1.509 | -0.466 | -0.213 |
| 0.252000000000002 | -1.502 | -0.463 | -0.211 |
| 0.254000000000002 | -1.495 | -0.46 | -0.21 |
| 0.256000000000002 | -1.488 | -0.457 | -0.208 |
| 0.258000000000002 | -1.481 | -0.454 | -0.206 |
| 0.260000000000002 | -1.474 | -0.451 | -0.204 |
| 0.262000000000002 | -1.468 | -0.448 | -0.203 |
| 0.264000000000002 | -1.461 | -0.446 | -0.201 |
| 0.266000000000002 | -1.454 | -0.443 | -0.199 |
| 0.268000000000002 | -1.448 | -0.44 | -0.198 |
| 0.270000000000002 | -1.441 | -0.437 | -0.196 |
| 0.272000000000002 | -1.435 | -0.434 | -0.195 |
| 0.274000000000002 | -1.429 | -0.431 | -0.193 |
| 0.276000000000002 | -1.422 | -0.429 | -0.191 |
| 0.278000000000002 | -1.416 | -0.426 | -0.19 |
| 0.280000000000002 | -1.41 | -0.423 | -0.188 |
| 0.282000000000002 | -1.404 | -0.421 | -0.187 |
| 0.284000000000002 | -1.397 | -0.418 | -0.185 |
| 0.286000000000002 | -1.391 | -0.416 | -0.184 |
| 0.288000000000002 | -1.385 | -0.413 | -0.182 |
| 0.290000000000002 | -1.379 | -0.41 | -0.181 |
| 0.292000000000002 | -1.373 | -0.408 | -0.18 |
| 0.294000000000002 | -1.368 | -0.405 | -0.178 |
| 0.296000000000002 | -1.362 | -0.403 | -0.177 |
| 0.298000000000002 | -1.356 | -0.4 | -0.175 |
| 0.300000000000002 | -1.35 | -0.398 | -0.174 |
| 0.302000000000002 | -1.345 | -0.396 | -0.173 |
| 0.304000000000002 | -1.339 | -0.393 | -0.171 |
| 0.306000000000002 | -1.333 | -0.391 | -0.17 |
| 0.308000000000002 | -1.328 | -0.388 | -0.169 |
| 0.310000000000002 | -1.322 | -0.386 | -0.167 |
| 0.312000000000002 | -1.317 | -0.384 | -0.166 |
| 0.314000000000002 | -1.311 | -0.381 | -0.165 |
| 0.316000000000002 | -1.306 | -0.379 | -0.163 |
| 0.318000000000002 | -1.3 | -0.377 | -0.162 |
| 0.320000000000002 | -1.295 | -0.375 | -0.161 |
| 0.322000000000002 | -1.29 | -0.372 | -0.16 |
| 0.324000000000002 | -1.285 | -0.37 | -0.158 |
| 0.326000000000002 | -1.279 | -0.368 | -0.157 |
| 0.328000000000002 | -1.274 | -0.366 | -0.156 |
| 0.330000000000002 | -1.269 | -0.364 | -0.155 |
| 0.332000000000002 | -1.264 | -0.362 | -0.154 |
| 0.334000000000002 | -1.259 | -0.359 | -0.153 |
| 0.336000000000002 | -1.254 | -0.357 | -0.151 |
| 0.338000000000002 | -1.249 | -0.355 | -0.15 |
| 0.340000000000002 | -1.244 | -0.353 | -0.149 |
| 0.342000000000002 | -1.239 | -0.351 | -0.148 |
| 0.344000000000002 | -1.234 | -0.349 | -0.147 |
| 0.346000000000002 | -1.229 | -0.347 | -0.146 |
| 0.348000000000002 | -1.225 | -0.345 | -0.145 |
| 0.350000000000002 | -1.22 | -0.343 | -0.144 |
| 0.352000000000002 | -1.215 | -0.341 | -0.142 |
| 0.354000000000002 | -1.21 | -0.339 | -0.141 |
| 0.356000000000002 | -1.206 | -0.337 | -0.14 |
| 0.358000000000002 | -1.201 | -0.335 | -0.139 |
| 0.360000000000002 | -1.196 | -0.333 | -0.138 |
| 0.362000000000002 | -1.192 | -0.332 | -0.137 |
| 0.364000000000002 | -1.187 | -0.33 | -0.136 |
| 0.366000000000002 | -1.183 | -0.328 | -0.135 |
| 0.368000000000002 | -1.178 | -0.326 | -0.134 |
| 0.370000000000002 | -1.174 | -0.324 | -0.133 |
| 0.372000000000002 | -1.169 | -0.322 | -0.132 |
| 0.374000000000002 | -1.165 | -0.321 | -0.131 |
| 0.376000000000002 | -1.16 | -0.319 | -0.13 |
| 0.378000000000002 | -1.156 | -0.317 | -0.129 |
| 0.380000000000002 | -1.152 | -0.315 | -0.128 |
| 0.382000000000002 | -1.147 | -0.313 | -0.128 |
| 0.384000000000002 | -1.143 | -0.312 | -0.127 |
| 0.386000000000002 | -1.139 | -0.31 | -0.126 |
| 0.388000000000002 | -1.134 | -0.308 | -0.125 |
| 0.390000000000002 | -1.13 | -0.307 | -0.124 |
| 0.392000000000002 | -1.126 | -0.305 | -0.123 |
| 0.394000000000002 | -1.122 | -0.303 | -0.122 |
| 0.396000000000002 | -1.118 | -0.302 | -0.121 |
| 0.398000000000002 | -1.114 | -0.3 | -0.12 |
| 0.400000000000002 | -1.11 | -0.298 | -0.119 |
| 0.402000000000002 | -1.106 | -0.297 | -0.119 |
| 0.404000000000002 | -1.102 | -0.295 | -0.118 |
| 0.406000000000002 | -1.098 | -0.293 | -0.117 |
| 0.408000000000002 | -1.094 | -0.292 | -0.116 |
| 0.410000000000002 | -1.09 | -0.29 | -0.115 |
| 0.412000000000002 | -1.086 | -0.289 | -0.114 |
| 0.414000000000002 | -1.082 | -0.287 | -0.114 |
| 0.416000000000002 | -1.078 | -0.286 | -0.113 |
| 0.418000000000002 | -1.074 | -0.284 | -0.112 |
| 0.420000000000002 | -1.07 | -0.283 | -0.111 |
| 0.422000000000002 | -1.066 | -0.281 | -0.11 |
| 0.424000000000002 | -1.063 | -0.28 | -0.11 |
| 0.426000000000002 | -1.059 | -0.278 | -0.109 |
| 0.428000000000002 | -1.055 | -0.277 | -0.108 |
| 0.430000000000002 | -1.051 | -0.275 | -0.107 |
| 0.432000000000002 | -1.048 | -0.274 | -0.107 |
| 0.434000000000002 | -1.044 | -0.272 | -0.106 |
| 0.436000000000002 | -1.04 | -0.271 | -0.105 |
| 0.438000000000002 | -1.037 | -0.269 | -0.104 |
| 0.440000000000002 | -1.033 | -0.268 | -0.104 |
| 0.442000000000002 | -1.029 | -0.266 | -0.103 |
| 0.444000000000002 | -1.026 | -0.265 | -0.102 |
| 0.446000000000002 | -1.022 | -0.264 | -0.101 |
| 0.448000000000002 | -1.019 | -0.262 | -0.101 |
| 0.450000000000002 | -1.015 | -0.261 | -0.1 |
| 0.452000000000002 | -1.012 | -0.26 | -0.099 |
| 0.454000000000002 | -1.008 | -0.258 | -0.099 |
| 0.456000000000002 | -1.005 | -0.257 | -0.098 |
| 0.458000000000002 | -1.001 | -0.256 | -0.097 |
| 0.460000000000002 | -0.998 | -0.254 | -0.097 |
| 0.462000000000002 | -0.994 | -0.253 | -0.096 |
| 0.464000000000002 | -0.991 | -0.252 | -0.095 |
| 0.466000000000002 | -0.988 | -0.25 | -0.095 |
| 0.468000000000002 | -0.984 | -0.249 | -0.094 |
| 0.470000000000002 | -0.981 | -0.248 | -0.093 |
| 0.472000000000002 | -0.978 | -0.246 | -0.093 |
| 0.474000000000002 | -0.974 | -0.245 | -0.092 |
| 0.476000000000002 | -0.971 | -0.244 | -0.091 |
| 0.478000000000002 | -0.968 | -0.243 | -0.091 |
| 0.480000000000002 | -0.964 | -0.241 | -0.09 |
| 0.482000000000002 | -0.961 | -0.24 | -0.09 |
| 0.484000000000002 | -0.958 | -0.239 | -0.089 |
| 0.486000000000002 | -0.955 | -0.238 | -0.088 |
| 0.488000000000002 | -0.952 | -0.236 | -0.088 |
| 0.490000000000002 | -0.948 | -0.235 | -0.087 |
| 0.492000000000002 | -0.945 | -0.234 | -0.086 |
| 0.494000000000002 | -0.942 | -0.233 | -0.086 |
| 0.496000000000002 | -0.939 | -0.232 | -0.085 |
| 0.498000000000002 | -0.936 | -0.231 | -0.085 |
| 0.500000000000002 | -0.933 | -0.229 | -0.084 |
| 0.502000000000002 | -0.93 | -0.228 | -0.084 |
| 0.504000000000002 | -0.927 | -0.227 | -0.083 |
| 0.506000000000002 | -0.924 | -0.226 | -0.082 |
| 0.508000000000002 | -0.921 | -0.225 | -0.082 |
| 0.510000000000002 | -0.918 | -0.224 | -0.081 |
| 0.512000000000002 | -0.915 | -0.222 | -0.081 |
| 0.514000000000002 | -0.912 | -0.221 | -0.08 |
| 0.516000000000002 | -0.909 | -0.22 | -0.08 |
| 0.518000000000002 | -0.906 | -0.219 | -0.079 |
| 0.520000000000002 | -0.903 | -0.218 | -0.079 |
| 0.522000000000002 | -0.9 | -0.217 | -0.078 |
| 0.524000000000002 | -0.897 | -0.216 | -0.078 |
| 0.526000000000002 | -0.894 | -0.215 | -0.077 |
| 0.528000000000002 | -0.891 | -0.214 | -0.077 |
| 0.530000000000002 | -0.888 | -0.213 | -0.076 |
| 0.532000000000002 | -0.885 | -0.212 | -0.076 |
| 0.534000000000002 | -0.883 | -0.211 | -0.075 |
| 0.536000000000002 | -0.88 | -0.21 | -0.075 |
| 0.538000000000002 | -0.877 | -0.208 | -0.074 |
| 0.540000000000002 | -0.874 | -0.207 | -0.074 |
| 0.542000000000002 | -0.871 | -0.206 | -0.073 |
| 0.544000000000002 | -0.869 | -0.205 | -0.073 |
| 0.546000000000002 | -0.866 | -0.204 | -0.072 |
| 0.548000000000002 | -0.863 | -0.203 | -0.072 |
| 0.550000000000002 | -0.86 | -0.202 | -0.071 |
| 0.552000000000002 | -0.858 | -0.201 | -0.071 |
| 0.554000000000002 | -0.855 | -0.2 | -0.07 |
| 0.556000000000002 | -0.852 | -0.199 | -0.07 |
| 0.558000000000002 | -0.849 | -0.198 | -0.069 |
| 0.560000000000002 | -0.847 | -0.197 | -0.069 |
| 0.562000000000002 | -0.844 | -0.197 | -0.068 |
| 0.564000000000002 | -0.841 | -0.196 | -0.068 |
| 0.566000000000002 | -0.839 | -0.195 | -0.067 |
| 0.568000000000002 | -0.836 | -0.194 | -0.067 |
| 0.570000000000002 | -0.834 | -0.193 | -0.067 |
| 0.572000000000002 | -0.831 | -0.192 | -0.066 |
| 0.574000000000002 | -0.828 | -0.191 | -0.066 |
| 0.576000000000002 | -0.826 | -0.19 | -0.065 |
| 0.578000000000002 | -0.823 | -0.189 | -0.065 |
| 0.580000000000002 | -0.821 | -0.188 | -0.064 |
| 0.582000000000002 | -0.818 | -0.187 | -0.064 |
| 0.584000000000002 | -0.816 | -0.186 | -0.063 |
| 0.586000000000002 | -0.813 | -0.185 | -0.063 |
| 0.588000000000002 | -0.811 | -0.184 | -0.063 |
| 0.590000000000002 | -0.808 | -0.184 | -0.062 |
| 0.592000000000002 | -0.806 | -0.183 | -0.062 |
| 0.594000000000002 | -0.803 | -0.182 | -0.061 |
| 0.596000000000002 | -0.801 | -0.181 | -0.061 |
| 0.598000000000002 | -0.798 | -0.18 | -0.061 |
| 0.600000000000002 | -0.796 | -0.179 | -0.06 |
| 0.602000000000002 | -0.793 | -0.178 | -0.06 |
| 0.604000000000002 | -0.791 | -0.177 | -0.059 |
| 0.606000000000002 | -0.789 | -0.177 | -0.059 |
| 0.608000000000002 | -0.786 | -0.176 | -0.059 |
| 0.610000000000002 | -0.784 | -0.175 | -0.058 |
| 0.612000000000002 | -0.781 | -0.174 | -0.058 |
| 0.614000000000002 | -0.779 | -0.173 | -0.058 |
| 0.616000000000002 | -0.777 | -0.172 | -0.057 |
| 0.618000000000002 | -0.774 | -0.172 | -0.057 |
| 0.620000000000002 | -0.772 | -0.171 | -0.056 |
| 0.622000000000002 | -0.77 | -0.17 | -0.056 |
| 0.624000000000002 | -0.767 | -0.169 | -0.056 |
| 0.626000000000002 | -0.765 | -0.168 | -0.055 |
| 0.628000000000002 | -0.763 | -0.168 | -0.055 |
| 0.630000000000002 | -0.761 | -0.167 | -0.055 |
| 0.632000000000002 | -0.758 | -0.166 | -0.054 |
| 0.634000000000002 | -0.756 | -0.165 | -0.054 |
| 0.636000000000002 | -0.754 | -0.164 | -0.054 |
| 0.638000000000002 | -0.752 | -0.164 | -0.053 |
| 0.640000000000002 | -0.749 | -0.163 | -0.053 |
| 0.642000000000002 | -0.747 | -0.162 | -0.053 |
| 0.644000000000002 | -0.745 | -0.161 | -0.052 |
| 0.646000000000002 | -0.743 | -0.161 | -0.052 |
| 0.648000000000002 | -0.74 | -0.16 | -0.051 |
| 0.650000000000002 | -0.738 | -0.159 | -0.051 |
| 0.652000000000002 | -0.736 | -0.158 | -0.051 |
| 0.654000000000002 | -0.734 | -0.158 | -0.05 |
| 0.656000000000002 | -0.732 | -0.157 | -0.05 |
| 0.658000000000002 | -0.73 | -0.156 | -0.05 |
| 0.660000000000002 | -0.727 | -0.155 | -0.05 |
| 0.662000000000002 | -0.725 | -0.155 | -0.049 |
| 0.664000000000002 | -0.723 | -0.154 | -0.049 |
| 0.666000000000002 | -0.721 | -0.153 | -0.049 |
| 0.668000000000002 | -0.719 | -0.153 | -0.048 |
| 0.670000000000002 | -0.717 | -0.152 | -0.048 |
| 0.672000000000002 | -0.715 | -0.151 | -0.048 |
| 0.674000000000002 | -0.713 | -0.15 | -0.047 |
| 0.676000000000002 | -0.711 | -0.15 | -0.047 |
| 0.678000000000002 | -0.709 | -0.149 | -0.047 |
| 0.680000000000002 | -0.706 | -0.148 | -0.046 |
| 0.682000000000002 | -0.704 | -0.148 | -0.046 |
| 0.684000000000002 | -0.702 | -0.147 | -0.046 |
| 0.686000000000002 | -0.7 | -0.146 | -0.046 |
| 0.688000000000002 | -0.698 | -0.146 | -0.045 |
| 0.690000000000002 | -0.696 | -0.145 | -0.045 |
| 0.692000000000002 | -0.694 | -0.144 | -0.045 |
| 0.694000000000002 | -0.692 | -0.144 | -0.044 |
| 0.696000000000002 | -0.69 | -0.143 | -0.044 |
| 0.698000000000002 | -0.688 | -0.142 | -0.044 |
| 0.700000000000002 | -0.686 | -0.142 | -0.044 |
| 0.702000000000002 | -0.684 | -0.141 | -0.043 |
| 0.704000000000002 | -0.682 | -0.14 | -0.043 |
| 0.706000000000002 | -0.68 | -0.14 | -0.043 |
| 0.708000000000002 | -0.679 | -0.139 | -0.042 |
| 0.710000000000002 | -0.677 | -0.138 | -0.042 |
| 0.712000000000002 | -0.675 | -0.138 | -0.042 |
| 0.714000000000002 | -0.673 | -0.137 | -0.042 |
| 0.716000000000002 | -0.671 | -0.136 | -0.041 |
| 0.718000000000002 | -0.669 | -0.136 | -0.041 |
| 0.720000000000002 | -0.667 | -0.135 | -0.041 |
| 0.722000000000002 | -0.665 | -0.135 | -0.041 |
| 0.724000000000002 | -0.663 | -0.134 | -0.04 |
| 0.726000000000002 | -0.661 | -0.133 | -0.04 |
| 0.728000000000002 | -0.659 | -0.133 | -0.04 |
| 0.730000000000002 | -0.658 | -0.132 | -0.04 |
| 0.732000000000002 | -0.656 | -0.132 | -0.039 |
| 0.734000000000002 | -0.654 | -0.131 | -0.039 |
| 0.736000000000002 | -0.652 | -0.13 | -0.039 |
| 0.738000000000002 | -0.65 | -0.13 | -0.039 |
| 0.740000000000002 | -0.648 | -0.129 | -0.038 |
| 0.742000000000002 | -0.647 | -0.129 | -0.038 |
| 0.744000000000002 | -0.645 | -0.128 | -0.038 |
| 0.746000000000002 | -0.643 | -0.127 | -0.038 |
| 0.748000000000002 | -0.641 | -0.127 | -0.037 |
| 0.750000000000002 | -0.639 | -0.126 | -0.037 |
| 0.752000000000002 | -0.638 | -0.126 | -0.037 |
| 0.754000000000002 | -0.636 | -0.125 | -0.037 |
| 0.756000000000002 | -0.634 | -0.125 | -0.036 |
| 0.758000000000002 | -0.632 | -0.124 | -0.036 |
| 0.760000000000002 | -0.63 | -0.123 | -0.036 |
| 0.762000000000002 | -0.629 | -0.123 | -0.036 |
| 0.764000000000002 | -0.627 | -0.122 | -0.036 |
| 0.766000000000002 | -0.625 | -0.122 | -0.035 |
| 0.768000000000002 | -0.624 | -0.121 | -0.035 |
| 0.770000000000002 | -0.622 | -0.121 | -0.035 |
| 0.772000000000002 | -0.62 | -0.12 | -0.035 |
| 0.774000000000002 | -0.618 | -0.12 | -0.034 |
| 0.776000000000002 | -0.617 | -0.119 | -0.034 |
| 0.778000000000002 | -0.615 | -0.118 | -0.034 |
| 0.780000000000002 | -0.613 | -0.118 | -0.034 |
| 0.782000000000002 | -0.612 | -0.117 | -0.034 |
| 0.784000000000002 | -0.61 | -0.117 | -0.033 |
| 0.786000000000002 | -0.608 | -0.116 | -0.033 |
| 0.788000000000002 | -0.607 | -0.116 | -0.033 |
| 0.790000000000002 | -0.605 | -0.115 | -0.033 |
| 0.792000000000002 | -0.603 | -0.115 | -0.033 |
| 0.794000000000002 | -0.602 | -0.114 | -0.032 |
| 0.796000000000002 | -0.6 | -0.114 | -0.032 |
| 0.798000000000002 | -0.598 | -0.113 | -0.032 |
| 0.800000000000002 | -0.597 | -0.113 | -0.032 |
| 0.802000000000002 | -0.595 | -0.112 | -0.032 |
| 0.804000000000002 | -0.593 | -0.112 | -0.031 |
| 0.806000000000002 | -0.592 | -0.111 | -0.031 |
| 0.808000000000002 | -0.59 | -0.111 | -0.031 |
| 0.810000000000002 | -0.589 | -0.11 | -0.031 |
| 0.812000000000002 | -0.587 | -0.11 | -0.031 |
| 0.814000000000002 | -0.585 | -0.109 | -0.03 |
| 0.816000000000002 | -0.584 | -0.109 | -0.03 |
| 0.818000000000002 | -0.582 | -0.108 | -0.03 |
| 0.820000000000002 | -0.581 | -0.108 | -0.03 |
| 0.822000000000002 | -0.579 | -0.107 | -0.03 |
| 0.824000000000002 | -0.577 | -0.107 | -0.029 |
| 0.826000000000002 | -0.576 | -0.106 | -0.029 |
| 0.828000000000002 | -0.574 | -0.106 | -0.029 |
| 0.830000000000002 | -0.573 | -0.105 | -0.029 |
| 0.832000000000002 | -0.571 | -0.105 | -0.029 |
| 0.834000000000002 | -0.57 | -0.105 | -0.028 |
| 0.836000000000002 | -0.568 | -0.104 | -0.028 |
| 0.838000000000002 | -0.567 | -0.104 | -0.028 |
| 0.840000000000002 | -0.565 | -0.103 | -0.028 |
| 0.842000000000002 | -0.564 | -0.103 | -0.028 |
| 0.844000000000002 | -0.562 | -0.102 | -0.028 |
| 0.846000000000002 | -0.561 | -0.102 | -0.027 |
| 0.848000000000002 | -0.559 | -0.101 | -0.027 |
| 0.850000000000002 | -0.558 | -0.101 | -0.027 |
| 0.852000000000002 | -0.556 | -0.1 | -0.027 |
| 0.854000000000002 | -0.555 | -0.1 | -0.027 |
| 0.856000000000002 | -0.553 | -0.1 | -0.027 |
| 0.858000000000002 | -0.552 | -0.099 | -0.026 |
| 0.860000000000002 | -0.55 | -0.099 | -0.026 |
| 0.862000000000002 | -0.549 | -0.098 | -0.026 |
| 0.864000000000002 | -0.547 | -0.098 | -0.026 |
| 0.866000000000002 | -0.546 | -0.097 | -0.026 |
| 0.868000000000002 | -0.544 | -0.097 | -0.026 |
| 0.870000000000002 | -0.543 | -0.097 | -0.025 |
| 0.872000000000002 | -0.541 | -0.096 | -0.025 |
| 0.874000000000002 | -0.54 | -0.096 | -0.025 |
| 0.876000000000002 | -0.539 | -0.095 | -0.025 |
| 0.878000000000002 | -0.537 | -0.095 | -0.025 |
| 0.880000000000002 | -0.536 | -0.094 | -0.025 |
| 0.882000000000002 | -0.534 | -0.094 | -0.025 |
| 0.884000000000002 | -0.533 | -0.094 | -0.024 |
| 0.886000000000002 | -0.532 | -0.093 | -0.024 |
| 0.888000000000002 | -0.53 | -0.093 | -0.024 |
| 0.890000000000002 | -0.529 | -0.092 | -0.024 |
| 0.892000000000002 | -0.527 | -0.092 | -0.024 |
| 0.894000000000002 | -0.526 | -0.092 | -0.024 |
| 0.896000000000002 | -0.525 | -0.091 | -0.023 |
| 0.898000000000002 | -0.523 | -0.091 | -0.023 |
| 0.900000000000002 | -0.522 | -0.09 | -0.023 |
| 0.902000000000002 | -0.52 | -0.09 | -0.023 |
| 0.904000000000002 | -0.519 | -0.09 | -0.023 |
| 0.906000000000002 | -0.518 | -0.089 | -0.023 |
| 0.908000000000002 | -0.516 | -0.089 | -0.023 |
| 0.910000000000002 | -0.515 | -0.088 | -0.022 |
| 0.912000000000002 | -0.514 | -0.088 | -0.022 |
| 0.914000000000002 | -0.512 | -0.088 | -0.022 |
| 0.916000000000002 | -0.511 | -0.087 | -0.022 |
| 0.918000000000002 | -0.51 | -0.087 | -0.022 |
| 0.920000000000002 | -0.508 | -0.086 | -0.022 |
| 0.922000000000002 | -0.507 | -0.086 | -0.022 |
| 0.924000000000002 | -0.506 | -0.086 | -0.022 |
| 0.926000000000002 | -0.504 | -0.085 | -0.021 |
| 0.928000000000002 | -0.503 | -0.085 | -0.021 |
| 0.930000000000002 | -0.502 | -0.085 | -0.021 |
| 0.932000000000002 | -0.5 | -0.084 | -0.021 |
| 0.934000000000002 | -0.499 | -0.084 | -0.021 |
| 0.936000000000002 | -0.498 | -0.084 | -0.021 |
| 0.938000000000002 | -0.497 | -0.083 | -0.021 |
| 0.940000000000002 | -0.495 | -0.083 | -0.02 |
| 0.942000000000002 | -0.494 | -0.082 | -0.02 |
| 0.944000000000002 | -0.493 | -0.082 | -0.02 |
| 0.946000000000002 | -0.491 | -0.082 | -0.02 |
| 0.948000000000002 | -0.49 | -0.081 | -0.02 |
| 0.950000000000002 | -0.489 | -0.081 | -0.02 |
| 0.952000000000002 | -0.488 | -0.081 | -0.02 |
| 0.954000000000002 | -0.486 | -0.08 | -0.02 |
| 0.956000000000002 | -0.485 | -0.08 | -0.019 |
| 0.958000000000002 | -0.484 | -0.08 | -0.019 |
| 0.960000000000002 | -0.483 | -0.079 | -0.019 |
| 0.962000000000002 | -0.481 | -0.079 | -0.019 |
| 0.964000000000002 | -0.48 | -0.079 | -0.019 |
| 0.966000000000002 | -0.479 | -0.078 | -0.019 |
| 0.968000000000002 | -0.478 | -0.078 | -0.019 |
| 0.970000000000002 | -0.477 | -0.078 | -0.019 |
| 0.972000000000002 | -0.475 | -0.077 | -0.019 |
| 0.974000000000003 | -0.474 | -0.077 | -0.018 |
| 0.976000000000003 | -0.473 | -0.077 | -0.018 |
| 0.978000000000003 | -0.472 | -0.076 | -0.018 |
| 0.980000000000002 | -0.471 | -0.076 | -0.018 |
| 0.982000000000002 | -0.469 | -0.076 | -0.018 |
| 0.984000000000003 | -0.468 | -0.075 | -0.018 |
| 0.986000000000003 | -0.467 | -0.075 | -0.018 |
| 0.988000000000003 | -0.466 | -0.075 | -0.018 |
| 0.990000000000002 | -0.465 | -0.074 | -0.018 |
| 0.992000000000002 | -0.463 | -0.074 | -0.017 |
| 0.994000000000003 | -0.462 | -0.074 | -0.017 |
| 0.996000000000003 | -0.461 | -0.073 | -0.017 |
| 0.998000000000003 | -0.46 | -0.073 | -0.017 |
| 1.000000000000002 | -0.459 | -0.073 | -0.017 |
| 1.002000000000002 | -0.458 | -0.072 | -0.017 |
| 1.004000000000002 | -0.456 | -0.072 | -0.017 |
| 1.006000000000002 | -0.455 | -0.072 | -0.017 |
| 1.008000000000002 | -0.454 | -0.071 | -0.017 |
| 1.010000000000002 | -0.453 | -0.071 | -0.017 |
| 1.012000000000002 | -0.452 | -0.071 | -0.016 |
| 1.014000000000002 | -0.451 | -0.071 | -0.016 |
| 1.016000000000002 | -0.449 | -0.07 | -0.016 |
| 1.018000000000002 | -0.448 | -0.07 | -0.016 |
| 1.020000000000002 | -0.447 | -0.07 | -0.016 |
| 1.022000000000002 | -0.446 | -0.069 | -0.016 |
| 1.024000000000002 | -0.445 | -0.069 | -0.016 |
| 1.026000000000002 | -0.444 | -0.069 | -0.016 |
| 1.028000000000002 | -0.443 | -0.068 | -0.016 |
| 1.030000000000002 | -0.442 | -0.068 | -0.016 |
| 1.032000000000002 | -0.441 | -0.068 | -0.015 |
| 1.034000000000002 | -0.439 | -0.068 | -0.015 |
| 1.036000000000002 | -0.438 | -0.067 | -0.015 |
| 1.038000000000002 | -0.437 | -0.067 | -0.015 |
| 1.040000000000002 | -0.436 | -0.067 | -0.015 |
| 1.042000000000002 | -0.435 | -0.066 | -0.015 |
| 1.044000000000002 | -0.434 | -0.066 | -0.015 |
| 1.046000000000002 | -0.433 | -0.066 | -0.015 |
| 1.048000000000002 | -0.432 | -0.066 | -0.015 |
| 1.050000000000002 | -0.431 | -0.065 | -0.015 |
| 1.052000000000002 | -0.43 | -0.065 | -0.015 |
| 1.054000000000002 | -0.429 | -0.065 | -0.014 |
| 1.056000000000002 | -0.427 | -0.064 | -0.014 |
| 1.058000000000002 | -0.426 | -0.064 | -0.014 |
| 1.060000000000002 | -0.425 | -0.064 | -0.014 |
| 1.062000000000002 | -0.424 | -0.064 | -0.014 |
| 1.064000000000002 | -0.423 | -0.063 | -0.014 |
| 1.066000000000002 | -0.422 | -0.063 | -0.014 |
| 1.068000000000002 | -0.421 | -0.063 | -0.014 |
| 1.070000000000002 | -0.42 | -0.063 | -0.014 |
| 1.072000000000002 | -0.419 | -0.062 | -0.014 |
| 1.074000000000003 | -0.418 | -0.062 | -0.014 |
| 1.076000000000003 | -0.417 | -0.062 | -0.013 |
| 1.078000000000003 | -0.416 | -0.062 | -0.013 |
| 1.080000000000002 | -0.415 | -0.061 | -0.013 |
| 1.082000000000002 | -0.414 | -0.061 | -0.013 |
| 1.084000000000003 | -0.413 | -0.061 | -0.013 |
| 1.086000000000003 | -0.412 | -0.06 | -0.013 |
| 1.088000000000003 | -0.411 | -0.06 | -0.013 |
| 1.090000000000002 | -0.41 | -0.06 | -0.013 |
| 1.092000000000002 | -0.409 | -0.06 | -0.013 |
| 1.094000000000003 | -0.408 | -0.059 | -0.013 |
| 1.096000000000003 | -0.407 | -0.059 | -0.013 |
| 1.098000000000003 | -0.406 | -0.059 | -0.013 |
| 1.100000000000003 | -0.405 | -0.059 | -0.013 |
| 1.102000000000003 | -0.404 | -0.058 | -0.012 |
| 1.104000000000003 | -0.403 | -0.058 | -0.012 |
| 1.106000000000003 | -0.402 | -0.058 | -0.012 |
| 1.108000000000003 | -0.401 | -0.058 | -0.012 |
| 1.110000000000003 | -0.4 | -0.057 | -0.012 |
| 1.112000000000003 | -0.399 | -0.057 | -0.012 |
| 1.114000000000003 | -0.398 | -0.057 | -0.012 |
| 1.116000000000003 | -0.397 | -0.057 | -0.012 |
| 1.118000000000003 | -0.396 | -0.057 | -0.012 |
| 1.120000000000003 | -0.395 | -0.056 | -0.012 |
| 1.122000000000003 | -0.394 | -0.056 | -0.012 |
| 1.124000000000003 | -0.393 | -0.056 | -0.012 |
| 1.126000000000003 | -0.392 | -0.056 | -0.012 |
| 1.128000000000003 | -0.391 | -0.055 | -0.011 |
| 1.130000000000003 | -0.39 | -0.055 | -0.011 |
| 1.132000000000003 | -0.389 | -0.055 | -0.011 |
| 1.134000000000003 | -0.388 | -0.055 | -0.011 |
| 1.136000000000003 | -0.387 | -0.054 | -0.011 |
| 1.138000000000003 | -0.386 | -0.054 | -0.011 |
| 1.140000000000003 | -0.385 | -0.054 | -0.011 |
| 1.142000000000003 | -0.384 | -0.054 | -0.011 |
| 1.144000000000003 | -0.384 | -0.053 | -0.011 |
| 1.146000000000003 | -0.383 | -0.053 | -0.011 |
| 1.148000000000003 | -0.382 | -0.053 | -0.011 |
| 1.150000000000003 | -0.381 | -0.053 | -0.011 |
| 1.152000000000003 | -0.38 | -0.053 | -0.011 |
| 1.154000000000003 | -0.379 | -0.052 | -0.011 |
| 1.156000000000003 | -0.378 | -0.052 | -0.011 |
| 1.158000000000003 | -0.377 | -0.052 | -0.01 |
| 1.160000000000003 | -0.376 | -0.052 | -0.01 |
| 1.162000000000003 | -0.375 | -0.052 | -0.01 |
| 1.164000000000003 | -0.374 | -0.051 | -0.01 |
| 1.166000000000003 | -0.373 | -0.051 | -0.01 |
| 1.168000000000003 | -0.372 | -0.051 | -0.01 |
| 1.170000000000003 | -0.372 | -0.051 | -0.01 |
| 1.172000000000003 | -0.371 | -0.05 | -0.01 |
| 1.174000000000003 | -0.37 | -0.05 | -0.01 |
| 1.176000000000003 | -0.369 | -0.05 | -0.01 |
| 1.178000000000003 | -0.368 | -0.05 | -0.01 |
| 1.180000000000003 | -0.367 | -0.05 | -0.01 |
| 1.182000000000003 | -0.366 | -0.049 | -0.01 |
| 1.184000000000003 | -0.365 | -0.049 | -0.01 |
| 1.186000000000003 | -0.364 | -0.049 | -0.01 |
| 1.188000000000003 | -0.364 | -0.049 | -0.01 |
| 1.190000000000003 | -0.363 | -0.049 | -0.01 |
| 1.192000000000003 | -0.362 | -0.048 | -0.009 |
| 1.194000000000003 | -0.361 | -0.048 | -0.009 |
| 1.196000000000003 | -0.36 | -0.048 | -0.009 |
| 1.198000000000003 | -0.359 | -0.048 | -0.009 |
| 1.200000000000003 | -0.358 | -0.048 | -0.009 |
| 1.202000000000003 | -0.358 | -0.047 | -0.009 |
| 1.204000000000003 | -0.357 | -0.047 | -0.009 |
| 1.206000000000003 | -0.356 | -0.047 | -0.009 |
| 1.208000000000003 | -0.355 | -0.047 | -0.009 |
| 1.210000000000003 | -0.354 | -0.047 | -0.009 |
| 1.212000000000003 | -0.353 | -0.046 | -0.009 |
| 1.214000000000003 | -0.352 | -0.046 | -0.009 |
| 1.216000000000003 | -0.352 | -0.046 | -0.009 |
| 1.218000000000003 | -0.351 | -0.046 | -0.009 |
| 1.220000000000003 | -0.35 | -0.046 | -0.009 |
| 1.222000000000003 | -0.349 | -0.045 | -0.009 |
| 1.224000000000003 | -0.348 | -0.045 | -0.009 |
| 1.226000000000003 | -0.347 | -0.045 | -0.009 |
| 1.228000000000003 | -0.347 | -0.045 | -0.008 |
| 1.230000000000003 | -0.346 | -0.045 | -0.008 |
| 1.232000000000003 | -0.345 | -0.044 | -0.008 |
| 1.234000000000003 | -0.344 | -0.044 | -0.008 |
| 1.236000000000003 | -0.343 | -0.044 | -0.008 |
| 1.238000000000003 | -0.342 | -0.044 | -0.008 |
| 1.240000000000003 | -0.342 | -0.044 | -0.008 |
| 1.242000000000003 | -0.341 | -0.044 | -0.008 |
| 1.244000000000003 | -0.34 | -0.043 | -0.008 |
| 1.246000000000003 | -0.339 | -0.043 | -0.008 |
| 1.248000000000003 | -0.338 | -0.043 | -0.008 |
| 1.250000000000003 | -0.338 | -0.043 | -0.008 |
| 1.252000000000003 | -0.337 | -0.043 | -0.008 |
| 1.254000000000003 | -0.336 | -0.042 | -0.008 |
| 1.256000000000003 | -0.335 | -0.042 | -0.008 |
| 1.258000000000003 | -0.334 | -0.042 | -0.008 |
| 1.260000000000003 | -0.334 | -0.042 | -0.008 |
| 1.262000000000003 | -0.333 | -0.042 | -0.008 |
| 1.264000000000003 | -0.332 | -0.042 | -0.008 |
| 1.266000000000003 | -0.331 | -0.041 | -0.008 |
| 1.268000000000003 | -0.33 | -0.041 | -0.008 |
| 1.270000000000003 | -0.33 | -0.041 | -0.007 |
| 1.272000000000003 | -0.329 | -0.041 | -0.007 |
| 1.274000000000003 | -0.328 | -0.041 | -0.007 |
| 1.276000000000003 | -0.327 | -0.041 | -0.007 |
| 1.278000000000003 | -0.327 | -0.04 | -0.007 |
| 1.280000000000003 | -0.326 | -0.04 | -0.007 |
| 1.282000000000003 | -0.325 | -0.04 | -0.007 |
| 1.284000000000003 | -0.324 | -0.04 | -0.007 |
| 1.286000000000003 | -0.323 | -0.04 | -0.007 |
| 1.288000000000003 | -0.323 | -0.04 | -0.007 |
| 1.290000000000003 | -0.322 | -0.039 | -0.007 |
| 1.292000000000003 | -0.321 | -0.039 | -0.007 |
| 1.294000000000003 | -0.32 | -0.039 | -0.007 |
| 1.296000000000003 | -0.32 | -0.039 | -0.007 |
| 1.298000000000003 | -0.319 | -0.039 | -0.007 |
| 1.300000000000003 | -0.318 | -0.039 | -0.007 |
| 1.302000000000003 | -0.317 | -0.038 | -0.007 |
| 1.304000000000003 | -0.317 | -0.038 | -0.007 |
| 1.306000000000003 | -0.316 | -0.038 | -0.007 |
| 1.308000000000003 | -0.315 | -0.038 | -0.007 |
| 1.310000000000003 | -0.314 | -0.038 | -0.007 |
| 1.312000000000003 | -0.314 | -0.038 | -0.007 |
| 1.314000000000003 | -0.313 | -0.037 | -0.007 |
| 1.316000000000003 | -0.312 | -0.037 | -0.006 |
| 1.318000000000003 | -0.312 | -0.037 | -0.006 |
| 1.320000000000003 | -0.311 | -0.037 | -0.006 |
| 1.322000000000003 | -0.31 | -0.037 | -0.006 |
| 1.324000000000003 | -0.309 | -0.037 | -0.006 |
| 1.326000000000003 | -0.309 | -0.037 | -0.006 |
| 1.328000000000003 | -0.308 | -0.036 | -0.006 |
| 1.330000000000003 | -0.307 | -0.036 | -0.006 |
| 1.332000000000003 | -0.306 | -0.036 | -0.006 |
| 1.334000000000003 | -0.306 | -0.036 | -0.006 |
| 1.336000000000003 | -0.305 | -0.036 | -0.006 |
| 1.338000000000003 | -0.304 | -0.036 | -0.006 |
| 1.340000000000003 | -0.304 | -0.036 | -0.006 |
| 1.342000000000003 | -0.303 | -0.035 | -0.006 |
| 1.344000000000003 | -0.302 | -0.035 | -0.006 |
| 1.346000000000003 | -0.301 | -0.035 | -0.006 |
| 1.348000000000003 | -0.301 | -0.035 | -0.006 |
| 1.350000000000003 | -0.3 | -0.035 | -0.006 |
| 1.352000000000003 | -0.299 | -0.035 | -0.006 |
| 1.354000000000003 | -0.299 | -0.034 | -0.006 |
| 1.356000000000003 | -0.298 | -0.034 | -0.006 |
| 1.358000000000003 | -0.297 | -0.034 | -0.006 |
| 1.360000000000003 | -0.297 | -0.034 | -0.006 |
| 1.362000000000003 | -0.296 | -0.034 | -0.006 |
| 1.364000000000003 | -0.295 | -0.034 | -0.006 |
| 1.366000000000003 | -0.295 | -0.034 | -0.006 |
| 1.368000000000003 | -0.294 | -0.034 | -0.006 |
| 1.370000000000003 | -0.293 | -0.033 | -0.006 |
| 1.372000000000003 | -0.292 | -0.033 | -0.005 |
| 1.374000000000003 | -0.292 | -0.033 | -0.005 |
| 1.376000000000003 | -0.291 | -0.033 | -0.005 |
| 1.378000000000003 | -0.29 | -0.033 | -0.005 |
| 1.380000000000003 | -0.29 | -0.033 | -0.005 |
| 1.382000000000003 | -0.289 | -0.033 | -0.005 |
| 1.384000000000003 | -0.288 | -0.032 | -0.005 |
| 1.386000000000003 | -0.288 | -0.032 | -0.005 |
| 1.388000000000003 | -0.287 | -0.032 | -0.005 |
| 1.390000000000003 | -0.286 | -0.032 | -0.005 |
| 1.392000000000003 | -0.286 | -0.032 | -0.005 |
| 1.394000000000003 | -0.285 | -0.032 | -0.005 |
| 1.396000000000003 | -0.284 | -0.032 | -0.005 |
| 1.398000000000003 | -0.284 | -0.031 | -0.005 |
| 1.400000000000003 | -0.283 | -0.031 | -0.005 |
| 1.402000000000003 | -0.283 | -0.031 | -0.005 |
| 1.404000000000003 | -0.282 | -0.031 | -0.005 |
| 1.406000000000003 | -0.281 | -0.031 | -0.005 |
| 1.408000000000003 | -0.281 | -0.031 | -0.005 |
| 1.410000000000003 | -0.28 | -0.031 | -0.005 |
| 1.412000000000003 | -0.279 | -0.031 | -0.005 |
| 1.414000000000003 | -0.279 | -0.03 | -0.005 |
| 1.416000000000003 | -0.278 | -0.03 | -0.005 |
| 1.418000000000003 | -0.277 | -0.03 | -0.005 |
| 1.420000000000003 | -0.277 | -0.03 | -0.005 |
| 1.422000000000003 | -0.276 | -0.03 | -0.005 |
| 1.424000000000003 | -0.275 | -0.03 | -0.005 |
| 1.426000000000003 | -0.275 | -0.03 | -0.005 |
| 1.428000000000003 | -0.274 | -0.03 | -0.005 |
| 1.430000000000003 | -0.274 | -0.029 | -0.005 |
| 1.432000000000003 | -0.273 | -0.029 | -0.005 |
| 1.434000000000003 | -0.272 | -0.029 | -0.005 |
| 1.436000000000003 | -0.272 | -0.029 | -0.005 |
| 1.438000000000003 | -0.271 | -0.029 | -0.004 |
| 1.440000000000003 | -0.27 | -0.029 | -0.004 |
| 1.442000000000003 | -0.27 | -0.029 | -0.004 |
| 1.444000000000003 | -0.269 | -0.029 | -0.004 |
| 1.446000000000003 | -0.269 | -0.029 | -0.004 |
| 1.448000000000003 | -0.268 | -0.028 | -0.004 |
| 1.450000000000003 | -0.267 | -0.028 | -0.004 |
| 1.452000000000003 | -0.267 | -0.028 | -0.004 |
| 1.454000000000003 | -0.266 | -0.028 | -0.004 |
| 1.456000000000003 | -0.265 | -0.028 | -0.004 |
| 1.458000000000003 | -0.265 | -0.028 | -0.004 |
| 1.460000000000003 | -0.264 | -0.028 | -0.004 |
| 1.462000000000003 | -0.264 | -0.028 | -0.004 |
| 1.464000000000003 | -0.263 | -0.027 | -0.004 |
| 1.466000000000003 | -0.262 | -0.027 | -0.004 |
| 1.468000000000003 | -0.262 | -0.027 | -0.004 |
| 1.470000000000003 | -0.261 | -0.027 | -0.004 |
| 1.472000000000003 | -0.261 | -0.027 | -0.004 |
| 1.474000000000003 | -0.26 | -0.027 | -0.004 |
| 1.476000000000003 | -0.259 | -0.027 | -0.004 |
| 1.478000000000003 | -0.259 | -0.027 | -0.004 |
| 1.480000000000003 | -0.258 | -0.027 | -0.004 |
| 1.482000000000003 | -0.258 | -0.026 | -0.004 |
| 1.484000000000003 | -0.257 | -0.026 | -0.004 |
| 1.486000000000003 | -0.257 | -0.026 | -0.004 |
| 1.488000000000003 | -0.256 | -0.026 | -0.004 |
| 1.490000000000003 | -0.255 | -0.026 | -0.004 |
| 1.492000000000003 | -0.255 | -0.026 | -0.004 |
| 1.494000000000003 | -0.254 | -0.026 | -0.004 |
| 1.496000000000003 | -0.254 | -0.026 | -0.004 |
| 1.498000000000003 | -0.253 | -0.026 | -0.004 |
| 1.500000000000003 | -0.252 | -0.026 | -0.004 |
| 1.502000000000003 | -0.252 | -0.025 | -0.004 |
| 1.504000000000003 | -0.251 | -0.025 | -0.004 |
| 1.506000000000003 | -0.251 | -0.025 | -0.004 |
| 1.508000000000003 | -0.25 | -0.025 | -0.004 |
| 1.510000000000003 | -0.25 | -0.025 | -0.004 |
| 1.512000000000003 | -0.249 | -0.025 | -0.004 |
| 1.514000000000003 | -0.248 | -0.025 | -0.004 |
| 1.516000000000003 | -0.248 | -0.025 | -0.004 |
| 1.518000000000003 | -0.247 | -0.025 | -0.004 |
| 1.520000000000003 | -0.247 | -0.025 | -0.004 |
| 1.522000000000003 | -0.246 | -0.024 | -0.003 |
| 1.524000000000003 | -0.246 | -0.024 | -0.003 |
| 1.526000000000003 | -0.245 | -0.024 | -0.003 |
| 1.528000000000003 | -0.245 | -0.024 | -0.003 |
| 1.530000000000003 | -0.244 | -0.024 | -0.003 |
| 1.532000000000003 | -0.243 | -0.024 | -0.003 |
| 1.534000000000003 | -0.243 | -0.024 | -0.003 |
| 1.536000000000003 | -0.242 | -0.024 | -0.003 |
| 1.538000000000003 | -0.242 | -0.024 | -0.003 |
| 1.540000000000003 | -0.241 | -0.024 | -0.003 |
| 1.542000000000003 | -0.241 | -0.023 | -0.003 |
| 1.544000000000003 | -0.24 | -0.023 | -0.003 |
| 1.546000000000003 | -0.24 | -0.023 | -0.003 |
| 1.548000000000003 | -0.239 | -0.023 | -0.003 |
| 1.550000000000003 | -0.239 | -0.023 | -0.003 |
| 1.552000000000003 | -0.238 | -0.023 | -0.003 |
| 1.554000000000003 | -0.237 | -0.023 | -0.003 |
| 1.556000000000003 | -0.237 | -0.023 | -0.003 |
| 1.558000000000003 | -0.236 | -0.023 | -0.003 |
| 1.560000000000003 | -0.236 | -0.023 | -0.003 |
| 1.562000000000003 | -0.235 | -0.022 | -0.003 |
| 1.564000000000003 | -0.235 | -0.022 | -0.003 |
| 1.566000000000003 | -0.234 | -0.022 | -0.003 |
| 1.568000000000003 | -0.234 | -0.022 | -0.003 |
| 1.570000000000003 | -0.233 | -0.022 | -0.003 |
| 1.572000000000003 | -0.233 | -0.022 | -0.003 |
| 1.574000000000003 | -0.232 | -0.022 | -0.003 |
| 1.576000000000003 | -0.232 | -0.022 | -0.003 |
| 1.578000000000003 | -0.231 | -0.022 | -0.003 |
| 1.580000000000003 | -0.231 | -0.022 | -0.003 |
| 1.582000000000003 | -0.23 | -0.022 | -0.003 |
| 1.584000000000003 | -0.23 | -0.021 | -0.003 |
| 1.586000000000003 | -0.229 | -0.021 | -0.003 |
| 1.588000000000003 | -0.229 | -0.021 | -0.003 |
| 1.590000000000003 | -0.228 | -0.021 | -0.003 |
| 1.592000000000003 | -0.228 | -0.021 | -0.003 |
| 1.594000000000003 | -0.227 | -0.021 | -0.003 |
| 1.596000000000003 | -0.227 | -0.021 | -0.003 |
| 1.598000000000003 | -0.226 | -0.021 | -0.003 |
| 1.600000000000003 | -0.226 | -0.021 | -0.003 |
| 1.602000000000003 | -0.225 | -0.021 | -0.003 |
| 1.604000000000003 | -0.225 | -0.021 | -0.003 |
| 1.606000000000003 | -0.224 | -0.021 | -0.003 |
| 1.608000000000003 | -0.224 | -0.02 | -0.003 |
| 1.610000000000003 | -0.223 | -0.02 | -0.003 |
| 1.612000000000003 | -0.223 | -0.02 | -0.003 |
| 1.614000000000003 | -0.222 | -0.02 | -0.003 |
| 1.616000000000003 | -0.222 | -0.02 | -0.003 |
| 1.618000000000003 | -0.221 | -0.02 | -0.003 |
| 1.620000000000003 | -0.221 | -0.02 | -0.003 |
| 1.622000000000003 | -0.22 | -0.02 | -0.003 |
| 1.624000000000003 | -0.22 | -0.02 | -0.003 |
| 1.626000000000003 | -0.219 | -0.02 | -0.003 |
| 1.628000000000003 | -0.219 | -0.02 | -0.003 |
| 1.630000000000003 | -0.218 | -0.02 | -0.003 |
| 1.632000000000003 | -0.218 | -0.019 | -0.003 |
| 1.634000000000003 | -0.217 | -0.019 | -0.002 |
| 1.636000000000003 | -0.217 | -0.019 | -0.002 |
| 1.638000000000003 | -0.216 | -0.019 | -0.002 |
| 1.640000000000003 | -0.216 | -0.019 | -0.002 |
| 1.642000000000003 | -0.215 | -0.019 | -0.002 |
| 1.644000000000003 | -0.215 | -0.019 | -0.002 |
| 1.646000000000003 | -0.214 | -0.019 | -0.002 |
| 1.648000000000003 | -0.214 | -0.019 | -0.002 |
| 1.650000000000003 | -0.213 | -0.019 | -0.002 |
| 1.652000000000003 | -0.213 | -0.019 | -0.002 |
| 1.654000000000003 | -0.212 | -0.019 | -0.002 |
| 1.656000000000003 | -0.212 | -0.019 | -0.002 |
| 1.658000000000003 | -0.211 | -0.018 | -0.002 |
| 1.660000000000003 | -0.211 | -0.018 | -0.002 |
| 1.662000000000003 | -0.21 | -0.018 | -0.002 |
| 1.664000000000003 | -0.21 | -0.018 | -0.002 |
| 1.666000000000003 | -0.209 | -0.018 | -0.002 |
| 1.668000000000003 | -0.209 | -0.018 | -0.002 |
| 1.670000000000003 | -0.209 | -0.018 | -0.002 |
| 1.672000000000003 | -0.208 | -0.018 | -0.002 |
| 1.674000000000003 | -0.208 | -0.018 | -0.002 |
| 1.676000000000003 | -0.207 | -0.018 | -0.002 |
| 1.678000000000003 | -0.207 | -0.018 | -0.002 |
| 1.680000000000003 | -0.206 | -0.018 | -0.002 |
| 1.682000000000003 | -0.206 | -0.018 | -0.002 |
| 1.684000000000003 | -0.205 | -0.018 | -0.002 |
| 1.686000000000003 | -0.205 | -0.017 | -0.002 |
| 1.688000000000003 | -0.204 | -0.017 | -0.002 |
| 1.690000000000003 | -0.204 | -0.017 | -0.002 |
| 1.692000000000003 | -0.204 | -0.017 | -0.002 |
| 1.694000000000003 | -0.203 | -0.017 | -0.002 |
| 1.696000000000003 | -0.203 | -0.017 | -0.002 |
| 1.698000000000003 | -0.202 | -0.017 | -0.002 |
| 1.700000000000003 | -0.202 | -0.017 | -0.002 |
| 1.702000000000003 | -0.201 | -0.017 | -0.002 |
| 1.704000000000003 | -0.201 | -0.017 | -0.002 |
| 1.706000000000003 | -0.2 | -0.017 | -0.002 |
| 1.708000000000003 | -0.2 | -0.017 | -0.002 |
| 1.710000000000003 | -0.2 | -0.017 | -0.002 |
| 1.712000000000003 | -0.199 | -0.017 | -0.002 |
| 1.714000000000003 | -0.199 | -0.016 | -0.002 |
| 1.716000000000003 | -0.198 | -0.016 | -0.002 |
| 1.718000000000003 | -0.198 | -0.016 | -0.002 |
| 1.720000000000003 | -0.197 | -0.016 | -0.002 |
| 1.722000000000003 | -0.197 | -0.016 | -0.002 |
| 1.724000000000003 | -0.196 | -0.016 | -0.002 |
| 1.726000000000003 | -0.196 | -0.016 | -0.002 |
| 1.728000000000003 | -0.196 | -0.016 | -0.002 |
| 1.730000000000003 | -0.195 | -0.016 | -0.002 |
| 1.732000000000003 | -0.195 | -0.016 | -0.002 |
| 1.734000000000003 | -0.194 | -0.016 | -0.002 |
| 1.736000000000003 | -0.194 | -0.016 | -0.002 |
| 1.738000000000003 | -0.193 | -0.016 | -0.002 |
| 1.740000000000003 | -0.193 | -0.016 | -0.002 |
| 1.742000000000003 | -0.193 | -0.016 | -0.002 |
| 1.744000000000003 | -0.192 | -0.016 | -0.002 |
| 1.746000000000003 | -0.192 | -0.015 | -0.002 |
| 1.748000000000003 | -0.191 | -0.015 | -0.002 |
| 1.750000000000003 | -0.191 | -0.015 | -0.002 |
| 1.752000000000003 | -0.19 | -0.015 | -0.002 |
| 1.754000000000003 | -0.19 | -0.015 | -0.002 |
| 1.756000000000003 | -0.19 | -0.015 | -0.002 |
| 1.758000000000003 | -0.189 | -0.015 | -0.002 |
| 1.760000000000003 | -0.189 | -0.015 | -0.002 |
| 1.762000000000003 | -0.188 | -0.015 | -0.002 |
| 1.764000000000003 | -0.188 | -0.015 | -0.002 |
| 1.766000000000003 | -0.188 | -0.015 | -0.002 |
| 1.768000000000003 | -0.187 | -0.015 | -0.002 |
| 1.770000000000003 | -0.187 | -0.015 | -0.002 |
| 1.772000000000003 | -0.186 | -0.015 | -0.002 |
| 1.774000000000003 | -0.186 | -0.015 | -0.002 |
| 1.776000000000003 | -0.186 | -0.015 | -0.002 |
| 1.778000000000003 | -0.185 | -0.014 | -0.002 |
| 1.780000000000003 | -0.185 | -0.014 | -0.002 |
| 1.782000000000003 | -0.184 | -0.014 | -0.002 |
| 1.784000000000003 | -0.184 | -0.014 | -0.002 |
| 1.786000000000003 | -0.183 | -0.014 | -0.002 |
| 1.788000000000003 | -0.183 | -0.014 | -0.002 |
| 1.790000000000003 | -0.183 | -0.014 | -0.002 |
| 1.792000000000003 | -0.182 | -0.014 | -0.002 |
| 1.794000000000003 | -0.182 | -0.014 | -0.002 |
| 1.796000000000003 | -0.181 | -0.014 | -0.002 |
| 1.798000000000003 | -0.181 | -0.014 | -0.002 |
| 1.800000000000003 | -0.181 | -0.014 | -0.002 |
| 1.802000000000003 | -0.18 | -0.014 | -0.001 |
| 1.804000000000003 | -0.18 | -0.014 | -0.001 |
| 1.806000000000003 | -0.179 | -0.014 | -0.001 |
| 1.808000000000003 | -0.179 | -0.014 | -0.001 |
| 1.810000000000003 | -0.179 | -0.014 | -0.001 |
| 1.812000000000003 | -0.178 | -0.014 | -0.001 |
| 1.814000000000003 | -0.178 | -0.013 | -0.001 |
| 1.816000000000003 | -0.178 | -0.013 | -0.001 |
| 1.818000000000003 | -0.177 | -0.013 | -0.001 |
| 1.820000000000003 | -0.177 | -0.013 | -0.001 |
| 1.822000000000003 | -0.176 | -0.013 | -0.001 |
| 1.824000000000003 | -0.176 | -0.013 | -0.001 |
| 1.826000000000003 | -0.176 | -0.013 | -0.001 |
| 1.828000000000003 | -0.175 | -0.013 | -0.001 |
| 1.830000000000003 | -0.175 | -0.013 | -0.001 |
| 1.832000000000003 | -0.174 | -0.013 | -0.001 |
| 1.834000000000003 | -0.174 | -0.013 | -0.001 |
| 1.836000000000003 | -0.174 | -0.013 | -0.001 |
| 1.838000000000003 | -0.173 | -0.013 | -0.001 |
| 1.840000000000003 | -0.173 | -0.013 | -0.001 |
| 1.842000000000003 | -0.173 | -0.013 | -0.001 |
| 1.844000000000003 | -0.172 | -0.013 | -0.001 |
| 1.846000000000003 | -0.172 | -0.013 | -0.001 |
| 1.848000000000003 | -0.171 | -0.013 | -0.001 |
| 1.850000000000003 | -0.171 | -0.013 | -0.001 |
| 1.852000000000003 | -0.171 | -0.012 | -0.001 |
| 1.854000000000003 | -0.17 | -0.012 | -0.001 |
| 1.856000000000003 | -0.17 | -0.012 | -0.001 |
| 1.858000000000003 | -0.17 | -0.012 | -0.001 |
| 1.860000000000003 | -0.169 | -0.012 | -0.001 |
| 1.862000000000003 | -0.169 | -0.012 | -0.001 |
| 1.864000000000003 | -0.168 | -0.012 | -0.001 |
| 1.866000000000003 | -0.168 | -0.012 | -0.001 |
| 1.868000000000003 | -0.168 | -0.012 | -0.001 |
| 1.870000000000003 | -0.167 | -0.012 | -0.001 |
| 1.872000000000003 | -0.167 | -0.012 | -0.001 |
| 1.874000000000003 | -0.167 | -0.012 | -0.001 |
| 1.876000000000003 | -0.166 | -0.012 | -0.001 |
| 1.878000000000003 | -0.166 | -0.012 | -0.001 |
| 1.880000000000003 | -0.166 | -0.012 | -0.001 |
| 1.882000000000003 | -0.165 | -0.012 | -0.001 |
| 1.884000000000003 | -0.165 | -0.012 | -0.001 |
| 1.886000000000003 | -0.164 | -0.012 | -0.001 |
| 1.888000000000003 | -0.164 | -0.012 | -0.001 |
| 1.890000000000003 | -0.164 | -0.012 | -0.001 |
| 1.892000000000003 | -0.163 | -0.011 | -0.001 |
| 1.894000000000003 | -0.163 | -0.011 | -0.001 |
| 1.896000000000003 | -0.163 | -0.011 | -0.001 |
| 1.898000000000003 | -0.162 | -0.011 | -0.001 |
| 1.900000000000003 | -0.162 | -0.011 | -0.001 |
| 1.902000000000003 | -0.162 | -0.011 | -0.001 |
| 1.904000000000003 | -0.161 | -0.011 | -0.001 |
| 1.906000000000003 | -0.161 | -0.011 | -0.001 |
| 1.908000000000003 | -0.161 | -0.011 | -0.001 |
| 1.910000000000003 | -0.16 | -0.011 | -0.001 |
| 1.912000000000003 | -0.16 | -0.011 | -0.001 |
| 1.914000000000003 | -0.16 | -0.011 | -0.001 |
| 1.916000000000003 | -0.159 | -0.011 | -0.001 |
| 1.918000000000003 | -0.159 | -0.011 | -0.001 |
| 1.920000000000003 | -0.159 | -0.011 | -0.001 |
| 1.922000000000003 | -0.158 | -0.011 | -0.001 |
| 1.924000000000003 | -0.158 | -0.011 | -0.001 |
| 1.926000000000003 | -0.158 | -0.011 | -0.001 |
| 1.928000000000003 | -0.157 | -0.011 | -0.001 |
| 1.930000000000003 | -0.157 | -0.011 | -0.001 |
| 1.932000000000003 | -0.156 | -0.011 | -0.001 |
| 1.934000000000003 | -0.156 | -0.011 | -0.001 |
| 1.936000000000003 | -0.156 | -0.011 | -0.001 |
| 1.938000000000003 | -0.155 | -0.01 | -0.001 |
| 1.940000000000003 | -0.155 | -0.01 | -0.001 |
| 1.942000000000003 | -0.155 | -0.01 | -0.001 |
| 1.944000000000003 | -0.154 | -0.01 | -0.001 |
| 1.946000000000003 | -0.154 | -0.01 | -0.001 |
| 1.948000000000003 | -0.154 | -0.01 | -0.001 |
| 1.950000000000003 | -0.153 | -0.01 | -0.001 |
| 1.952000000000003 | -0.153 | -0.01 | -0.001 |
| 1.954000000000003 | -0.153 | -0.01 | -0.001 |
| 1.956000000000003 | -0.152 | -0.01 | -0.001 |
| 1.958000000000003 | -0.152 | -0.01 | -0.001 |
| 1.960000000000003 | -0.152 | -0.01 | -0.001 |
| 1.962000000000003 | -0.151 | -0.01 | -0.001 |
| 1.964000000000003 | -0.151 | -0.01 | -0.001 |
| 1.966000000000003 | -0.151 | -0.01 | -0.001 |
| 1.968000000000003 | -0.151 | -0.01 | -0.001 |
| 1.970000000000003 | -0.15 | -0.01 | -0.001 |
| 1.972000000000003 | -0.15 | -0.01 | -0.001 |
| 1.974000000000003 | -0.15 | -0.01 | -0.001 |
| 1.976000000000003 | -0.149 | -0.01 | -0.001 |
| 1.978000000000003 | -0.149 | -0.01 | -0.001 |
| 1.980000000000003 | -0.149 | -0.01 | -0.001 |
| 1.982000000000003 | -0.148 | -0.01 | -0.001 |
| 1.984000000000003 | -0.148 | -0.01 | -0.001 |
| 1.986000000000003 | -0.148 | -0.01 | -0.001 |
| 1.988000000000003 | -0.147 | -0.009 | -0.001 |
| 1.990000000000003 | -0.147 | -0.009 | -0.001 |
| 1.992000000000003 | -0.147 | -0.009 | -0.001 |
| 1.994000000000003 | -0.146 | -0.009 | -0.001 |
| 1.996000000000003 | -0.146 | -0.009 | -0.001 |
| 1.998000000000003 | -0.146 | -0.009 | -0.001 |
| 2.000000000000003 | -0.145 | -0.009 | -0.001 |